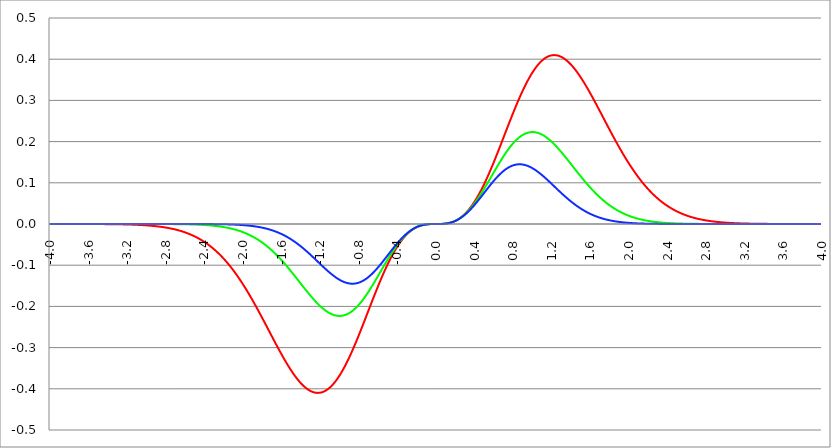
| Category | Series 1 | Series 0 | Series 2 |
|---|---|---|---|
| -4.0 | 0 | 0 | 0 |
| -3.996 | 0 | 0 | 0 |
| -3.992 | 0 | 0 | 0 |
| -3.988 | 0 | 0 | 0 |
| -3.984 | 0 | 0 | 0 |
| -3.98 | 0 | 0 | 0 |
| -3.976 | 0 | 0 | 0 |
| -3.972 | 0 | 0 | 0 |
| -3.968 | 0 | 0 | 0 |
| -3.964 | 0 | 0 | 0 |
| -3.96 | 0 | 0 | 0 |
| -3.956 | 0 | 0 | 0 |
| -3.952 | 0 | 0 | 0 |
| -3.948 | 0 | 0 | 0 |
| -3.944 | 0 | 0 | 0 |
| -3.94 | 0 | 0 | 0 |
| -3.936 | 0 | 0 | 0 |
| -3.932 | 0 | 0 | 0 |
| -3.928 | 0 | 0 | 0 |
| -3.924 | 0 | 0 | 0 |
| -3.92 | 0 | 0 | 0 |
| -3.916 | 0 | 0 | 0 |
| -3.912 | 0 | 0 | 0 |
| -3.908 | 0 | 0 | 0 |
| -3.904 | 0 | 0 | 0 |
| -3.9 | 0 | 0 | 0 |
| -3.896 | 0 | 0 | 0 |
| -3.892 | 0 | 0 | 0 |
| -3.888 | 0 | 0 | 0 |
| -3.884 | 0 | 0 | 0 |
| -3.88 | 0 | 0 | 0 |
| -3.876 | 0 | 0 | 0 |
| -3.872 | 0 | 0 | 0 |
| -3.868 | 0 | 0 | 0 |
| -3.864 | 0 | 0 | 0 |
| -3.86 | 0 | 0 | 0 |
| -3.856 | 0 | 0 | 0 |
| -3.852 | 0 | 0 | 0 |
| -3.848 | 0 | 0 | 0 |
| -3.844 | 0 | 0 | 0 |
| -3.84 | 0 | 0 | 0 |
| -3.836 | 0 | 0 | 0 |
| -3.832 | 0 | 0 | 0 |
| -3.828 | 0 | 0 | 0 |
| -3.824 | 0 | 0 | 0 |
| -3.82 | 0 | 0 | 0 |
| -3.816 | 0 | 0 | 0 |
| -3.812 | 0 | 0 | 0 |
| -3.808 | 0 | 0 | 0 |
| -3.804 | 0 | 0 | 0 |
| -3.8 | 0 | 0 | 0 |
| -3.796 | 0 | 0 | 0 |
| -3.792 | 0 | 0 | 0 |
| -3.788 | 0 | 0 | 0 |
| -3.784 | 0 | 0 | 0 |
| -3.78 | 0 | 0 | 0 |
| -3.776 | 0 | 0 | 0 |
| -3.772 | 0 | 0 | 0 |
| -3.768 | 0 | 0 | 0 |
| -3.764 | 0 | 0 | 0 |
| -3.76 | 0 | 0 | 0 |
| -3.756 | 0 | 0 | 0 |
| -3.752 | 0 | 0 | 0 |
| -3.748 | 0 | 0 | 0 |
| -3.744 | 0 | 0 | 0 |
| -3.74 | 0 | 0 | 0 |
| -3.736 | 0 | 0 | 0 |
| -3.732 | 0 | 0 | 0 |
| -3.728 | 0 | 0 | 0 |
| -3.724 | 0 | 0 | 0 |
| -3.72 | 0 | 0 | 0 |
| -3.716 | 0 | 0 | 0 |
| -3.712 | 0 | 0 | 0 |
| -3.708 | 0 | 0 | 0 |
| -3.704 | 0 | 0 | 0 |
| -3.7 | 0 | 0 | 0 |
| -3.696 | 0 | 0 | 0 |
| -3.692 | 0 | 0 | 0 |
| -3.688 | 0 | 0 | 0 |
| -3.684 | 0 | 0 | 0 |
| -3.68 | 0 | 0 | 0 |
| -3.676 | 0 | 0 | 0 |
| -3.672 | 0 | 0 | 0 |
| -3.668 | 0 | 0 | 0 |
| -3.664 | 0 | 0 | 0 |
| -3.66 | 0 | 0 | 0 |
| -3.656 | 0 | 0 | 0 |
| -3.652 | 0 | 0 | 0 |
| -3.648 | 0 | 0 | 0 |
| -3.644 | 0 | 0 | 0 |
| -3.64 | 0 | 0 | 0 |
| -3.636 | 0 | 0 | 0 |
| -3.632 | 0 | 0 | 0 |
| -3.628 | 0 | 0 | 0 |
| -3.624 | 0 | 0 | 0 |
| -3.62 | 0 | 0 | 0 |
| -3.616 | 0 | 0 | 0 |
| -3.612 | 0 | 0 | 0 |
| -3.608 | 0 | 0 | 0 |
| -3.604 | 0 | 0 | 0 |
| -3.6 | 0 | 0 | 0 |
| -3.596 | 0 | 0 | 0 |
| -3.592 | 0 | 0 | 0 |
| -3.588 | 0 | 0 | 0 |
| -3.584 | 0 | 0 | 0 |
| -3.58 | 0 | 0 | 0 |
| -3.576 | 0 | 0 | 0 |
| -3.572 | 0 | 0 | 0 |
| -3.568 | 0 | 0 | 0 |
| -3.564 | 0 | 0 | 0 |
| -3.56 | 0 | 0 | 0 |
| -3.556 | 0 | 0 | 0 |
| -3.552 | 0 | 0 | 0 |
| -3.548 | 0 | 0 | 0 |
| -3.544 | 0 | 0 | 0 |
| -3.54 | 0 | 0 | 0 |
| -3.536 | 0 | 0 | 0 |
| -3.532 | 0 | 0 | 0 |
| -3.528 | 0 | 0 | 0 |
| -3.524 | 0 | 0 | 0 |
| -3.52 | 0 | 0 | 0 |
| -3.516 | 0 | 0 | 0 |
| -3.512 | 0 | 0 | 0 |
| -3.508 | 0 | 0 | 0 |
| -3.504 | 0 | 0 | 0 |
| -3.5 | 0 | 0 | 0 |
| -3.496 | 0 | 0 | 0 |
| -3.492 | 0 | 0 | 0 |
| -3.488 | 0 | 0 | 0 |
| -3.484 | 0 | 0 | 0 |
| -3.48 | 0 | 0 | 0 |
| -3.476 | 0 | 0 | 0 |
| -3.472 | 0 | 0 | 0 |
| -3.467999999999999 | 0 | 0 | 0 |
| -3.463999999999999 | 0 | 0 | 0 |
| -3.459999999999999 | 0 | 0 | 0 |
| -3.455999999999999 | 0 | 0 | 0 |
| -3.451999999999999 | 0 | 0 | 0 |
| -3.447999999999999 | 0 | 0 | 0 |
| -3.443999999999999 | 0 | 0 | 0 |
| -3.439999999999999 | 0 | 0 | 0 |
| -3.435999999999999 | 0 | 0 | 0 |
| -3.431999999999999 | 0 | 0 | 0 |
| -3.427999999999999 | 0 | 0 | 0 |
| -3.423999999999999 | 0 | 0 | 0 |
| -3.419999999999999 | 0 | 0 | 0 |
| -3.415999999999999 | 0 | 0 | 0 |
| -3.411999999999999 | 0 | 0 | 0 |
| -3.407999999999999 | 0 | 0 | 0 |
| -3.403999999999999 | 0 | 0 | 0 |
| -3.399999999999999 | 0 | 0 | 0 |
| -3.395999999999999 | 0 | 0 | 0 |
| -3.391999999999999 | 0 | 0 | 0 |
| -3.387999999999999 | 0 | 0 | 0 |
| -3.383999999999999 | 0 | 0 | 0 |
| -3.379999999999999 | 0 | 0 | 0 |
| -3.375999999999999 | 0 | 0 | 0 |
| -3.371999999999999 | 0 | 0 | 0 |
| -3.367999999999999 | 0 | 0 | 0 |
| -3.363999999999999 | 0 | 0 | 0 |
| -3.359999999999999 | 0 | 0 | 0 |
| -3.355999999999999 | 0 | 0 | 0 |
| -3.351999999999999 | 0 | 0 | 0 |
| -3.347999999999999 | -0.001 | 0 | 0 |
| -3.343999999999999 | -0.001 | 0 | 0 |
| -3.339999999999999 | -0.001 | 0 | 0 |
| -3.335999999999999 | -0.001 | 0 | 0 |
| -3.331999999999999 | -0.001 | 0 | 0 |
| -3.327999999999999 | -0.001 | 0 | 0 |
| -3.323999999999999 | -0.001 | 0 | 0 |
| -3.319999999999999 | -0.001 | 0 | 0 |
| -3.315999999999999 | -0.001 | 0 | 0 |
| -3.311999999999999 | -0.001 | 0 | 0 |
| -3.307999999999999 | -0.001 | 0 | 0 |
| -3.303999999999999 | -0.001 | 0 | 0 |
| -3.299999999999999 | -0.001 | 0 | 0 |
| -3.295999999999999 | -0.001 | 0 | 0 |
| -3.291999999999999 | -0.001 | 0 | 0 |
| -3.288 | -0.001 | 0 | 0 |
| -3.284 | -0.001 | 0 | 0 |
| -3.279999999999999 | -0.001 | 0 | 0 |
| -3.275999999999999 | -0.001 | 0 | 0 |
| -3.271999999999999 | -0.001 | 0 | 0 |
| -3.268 | -0.001 | 0 | 0 |
| -3.264 | -0.001 | 0 | 0 |
| -3.259999999999999 | -0.001 | 0 | 0 |
| -3.255999999999999 | -0.001 | 0 | 0 |
| -3.251999999999999 | -0.001 | 0 | 0 |
| -3.248 | -0.001 | 0 | 0 |
| -3.244 | -0.001 | 0 | 0 |
| -3.239999999999999 | -0.001 | 0 | 0 |
| -3.235999999999999 | -0.001 | 0 | 0 |
| -3.231999999999999 | -0.001 | 0 | 0 |
| -3.228 | -0.001 | 0 | 0 |
| -3.224 | -0.001 | 0 | 0 |
| -3.219999999999999 | -0.001 | 0 | 0 |
| -3.215999999999999 | -0.001 | 0 | 0 |
| -3.211999999999999 | -0.001 | 0 | 0 |
| -3.208 | -0.001 | 0 | 0 |
| -3.204 | -0.001 | 0 | 0 |
| -3.199999999999999 | -0.001 | 0 | 0 |
| -3.195999999999999 | -0.001 | 0 | 0 |
| -3.191999999999999 | -0.001 | 0 | 0 |
| -3.188 | -0.001 | 0 | 0 |
| -3.184 | -0.001 | 0 | 0 |
| -3.179999999999999 | -0.001 | 0 | 0 |
| -3.175999999999999 | -0.001 | 0 | 0 |
| -3.171999999999999 | -0.001 | 0 | 0 |
| -3.168 | -0.001 | 0 | 0 |
| -3.164 | -0.001 | 0 | 0 |
| -3.159999999999999 | -0.001 | 0 | 0 |
| -3.155999999999999 | -0.001 | 0 | 0 |
| -3.151999999999999 | -0.002 | 0 | 0 |
| -3.148 | -0.002 | 0 | 0 |
| -3.144 | -0.002 | 0 | 0 |
| -3.139999999999999 | -0.002 | 0 | 0 |
| -3.135999999999999 | -0.002 | 0 | 0 |
| -3.131999999999999 | -0.002 | 0 | 0 |
| -3.128 | -0.002 | 0 | 0 |
| -3.124 | -0.002 | 0 | 0 |
| -3.119999999999999 | -0.002 | 0 | 0 |
| -3.115999999999999 | -0.002 | 0 | 0 |
| -3.111999999999999 | -0.002 | 0 | 0 |
| -3.108 | -0.002 | 0 | 0 |
| -3.104 | -0.002 | 0 | 0 |
| -3.099999999999999 | -0.002 | 0 | 0 |
| -3.095999999999999 | -0.002 | 0 | 0 |
| -3.091999999999999 | -0.002 | 0 | 0 |
| -3.088 | -0.002 | 0 | 0 |
| -3.084 | -0.002 | 0 | 0 |
| -3.079999999999999 | -0.002 | 0 | 0 |
| -3.075999999999999 | -0.002 | 0 | 0 |
| -3.071999999999999 | -0.002 | 0 | 0 |
| -3.068 | -0.002 | 0 | 0 |
| -3.064 | -0.002 | 0 | 0 |
| -3.059999999999999 | -0.002 | 0 | 0 |
| -3.055999999999999 | -0.003 | 0 | 0 |
| -3.051999999999999 | -0.003 | 0 | 0 |
| -3.048 | -0.003 | 0 | 0 |
| -3.044 | -0.003 | 0 | 0 |
| -3.039999999999999 | -0.003 | 0 | 0 |
| -3.035999999999999 | -0.003 | 0 | 0 |
| -3.031999999999999 | -0.003 | 0 | 0 |
| -3.028 | -0.003 | 0 | 0 |
| -3.024 | -0.003 | 0 | 0 |
| -3.019999999999999 | -0.003 | 0 | 0 |
| -3.015999999999999 | -0.003 | 0 | 0 |
| -3.011999999999999 | -0.003 | 0 | 0 |
| -3.008 | -0.003 | 0 | 0 |
| -3.004 | -0.003 | 0 | 0 |
| -2.999999999999999 | -0.003 | 0 | 0 |
| -2.995999999999999 | -0.003 | 0 | 0 |
| -2.991999999999999 | -0.003 | 0 | 0 |
| -2.988 | -0.004 | 0 | 0 |
| -2.984 | -0.004 | 0 | 0 |
| -2.979999999999999 | -0.004 | 0 | 0 |
| -2.975999999999999 | -0.004 | 0 | 0 |
| -2.971999999999999 | -0.004 | 0 | 0 |
| -2.968 | -0.004 | 0 | 0 |
| -2.964 | -0.004 | 0 | 0 |
| -2.959999999999999 | -0.004 | 0 | 0 |
| -2.955999999999999 | -0.004 | 0 | 0 |
| -2.951999999999999 | -0.004 | 0 | 0 |
| -2.948 | -0.004 | 0 | 0 |
| -2.944 | -0.004 | 0 | 0 |
| -2.939999999999999 | -0.004 | 0 | 0 |
| -2.935999999999999 | -0.005 | 0 | 0 |
| -2.931999999999999 | -0.005 | 0 | 0 |
| -2.928 | -0.005 | 0 | 0 |
| -2.924 | -0.005 | 0 | 0 |
| -2.919999999999999 | -0.005 | 0 | 0 |
| -2.915999999999999 | -0.005 | 0 | 0 |
| -2.911999999999999 | -0.005 | 0 | 0 |
| -2.908 | -0.005 | 0 | 0 |
| -2.904 | -0.005 | 0 | 0 |
| -2.899999999999999 | -0.005 | 0 | 0 |
| -2.895999999999999 | -0.006 | 0 | 0 |
| -2.891999999999999 | -0.006 | 0 | 0 |
| -2.887999999999999 | -0.006 | 0 | 0 |
| -2.883999999999999 | -0.006 | 0 | 0 |
| -2.879999999999999 | -0.006 | 0 | 0 |
| -2.875999999999999 | -0.006 | 0 | 0 |
| -2.871999999999999 | -0.006 | 0 | 0 |
| -2.867999999999999 | -0.006 | 0 | 0 |
| -2.863999999999999 | -0.006 | 0 | 0 |
| -2.859999999999999 | -0.007 | 0 | 0 |
| -2.855999999999999 | -0.007 | 0 | 0 |
| -2.851999999999999 | -0.007 | 0 | 0 |
| -2.847999999999999 | -0.007 | 0 | 0 |
| -2.843999999999999 | -0.007 | 0 | 0 |
| -2.839999999999999 | -0.007 | 0 | 0 |
| -2.835999999999999 | -0.007 | 0 | 0 |
| -2.831999999999999 | -0.007 | 0 | 0 |
| -2.827999999999999 | -0.008 | 0 | 0 |
| -2.823999999999999 | -0.008 | 0 | 0 |
| -2.819999999999999 | -0.008 | 0 | 0 |
| -2.815999999999999 | -0.008 | 0 | 0 |
| -2.811999999999999 | -0.008 | 0 | 0 |
| -2.807999999999999 | -0.008 | 0 | 0 |
| -2.803999999999999 | -0.008 | 0 | 0 |
| -2.799999999999999 | -0.009 | 0 | 0 |
| -2.795999999999999 | -0.009 | 0 | 0 |
| -2.791999999999999 | -0.009 | 0 | 0 |
| -2.787999999999999 | -0.009 | 0 | 0 |
| -2.783999999999999 | -0.009 | 0 | 0 |
| -2.779999999999999 | -0.009 | 0 | 0 |
| -2.775999999999999 | -0.01 | 0 | 0 |
| -2.771999999999999 | -0.01 | 0 | 0 |
| -2.767999999999999 | -0.01 | 0 | 0 |
| -2.763999999999999 | -0.01 | 0 | 0 |
| -2.759999999999999 | -0.01 | 0 | 0 |
| -2.755999999999999 | -0.011 | 0 | 0 |
| -2.751999999999999 | -0.011 | 0 | 0 |
| -2.747999999999999 | -0.011 | 0 | 0 |
| -2.743999999999999 | -0.011 | 0 | 0 |
| -2.739999999999999 | -0.011 | 0 | 0 |
| -2.735999999999999 | -0.011 | 0 | 0 |
| -2.731999999999999 | -0.012 | 0 | 0 |
| -2.727999999999999 | -0.012 | 0 | 0 |
| -2.723999999999999 | -0.012 | 0 | 0 |
| -2.719999999999999 | -0.012 | 0 | 0 |
| -2.715999999999999 | -0.013 | 0 | 0 |
| -2.711999999999999 | -0.013 | 0 | 0 |
| -2.707999999999999 | -0.013 | 0 | 0 |
| -2.703999999999999 | -0.013 | 0 | 0 |
| -2.699999999999999 | -0.013 | 0 | 0 |
| -2.695999999999999 | -0.014 | 0 | 0 |
| -2.691999999999999 | -0.014 | 0 | 0 |
| -2.687999999999999 | -0.014 | 0 | 0 |
| -2.683999999999999 | -0.014 | 0 | 0 |
| -2.679999999999999 | -0.015 | 0 | 0 |
| -2.675999999999999 | -0.015 | 0 | 0 |
| -2.671999999999999 | -0.015 | 0 | 0 |
| -2.667999999999999 | -0.015 | 0 | 0 |
| -2.663999999999999 | -0.016 | 0 | 0 |
| -2.659999999999999 | -0.016 | 0 | 0 |
| -2.655999999999999 | -0.016 | 0 | 0 |
| -2.651999999999999 | -0.016 | 0 | 0 |
| -2.647999999999999 | -0.017 | -0.001 | 0 |
| -2.643999999999999 | -0.017 | -0.001 | 0 |
| -2.639999999999999 | -0.017 | -0.001 | 0 |
| -2.635999999999999 | -0.018 | -0.001 | 0 |
| -2.631999999999999 | -0.018 | -0.001 | 0 |
| -2.627999999999999 | -0.018 | -0.001 | 0 |
| -2.623999999999999 | -0.018 | -0.001 | 0 |
| -2.619999999999999 | -0.019 | -0.001 | 0 |
| -2.615999999999999 | -0.019 | -0.001 | 0 |
| -2.611999999999999 | -0.019 | -0.001 | 0 |
| -2.607999999999999 | -0.02 | -0.001 | 0 |
| -2.603999999999999 | -0.02 | -0.001 | 0 |
| -2.599999999999999 | -0.02 | -0.001 | 0 |
| -2.595999999999999 | -0.021 | -0.001 | 0 |
| -2.591999999999999 | -0.021 | -0.001 | 0 |
| -2.587999999999999 | -0.021 | -0.001 | 0 |
| -2.583999999999999 | -0.022 | -0.001 | 0 |
| -2.579999999999999 | -0.022 | -0.001 | 0 |
| -2.575999999999999 | -0.022 | -0.001 | 0 |
| -2.571999999999999 | -0.023 | -0.001 | 0 |
| -2.567999999999999 | -0.023 | -0.001 | 0 |
| -2.563999999999999 | -0.024 | -0.001 | 0 |
| -2.559999999999999 | -0.024 | -0.001 | 0 |
| -2.555999999999999 | -0.024 | -0.001 | 0 |
| -2.551999999999999 | -0.025 | -0.001 | 0 |
| -2.547999999999999 | -0.025 | -0.001 | 0 |
| -2.543999999999999 | -0.025 | -0.001 | 0 |
| -2.539999999999999 | -0.026 | -0.001 | 0 |
| -2.535999999999999 | -0.026 | -0.001 | 0 |
| -2.531999999999999 | -0.027 | -0.001 | 0 |
| -2.527999999999999 | -0.027 | -0.001 | 0 |
| -2.523999999999999 | -0.028 | -0.001 | 0 |
| -2.519999999999999 | -0.028 | -0.001 | 0 |
| -2.515999999999999 | -0.028 | -0.001 | 0 |
| -2.511999999999999 | -0.029 | -0.001 | 0 |
| -2.507999999999999 | -0.029 | -0.001 | 0 |
| -2.503999999999999 | -0.03 | -0.001 | 0 |
| -2.499999999999999 | -0.03 | -0.001 | 0 |
| -2.495999999999999 | -0.031 | -0.001 | 0 |
| -2.491999999999999 | -0.031 | -0.001 | 0 |
| -2.487999999999999 | -0.032 | -0.001 | 0 |
| -2.483999999999999 | -0.032 | -0.001 | 0 |
| -2.479999999999999 | -0.033 | -0.002 | 0 |
| -2.475999999999999 | -0.033 | -0.002 | 0 |
| -2.471999999999999 | -0.034 | -0.002 | 0 |
| -2.467999999999999 | -0.034 | -0.002 | 0 |
| -2.463999999999999 | -0.035 | -0.002 | 0 |
| -2.459999999999999 | -0.035 | -0.002 | 0 |
| -2.455999999999999 | -0.036 | -0.002 | 0 |
| -2.451999999999999 | -0.036 | -0.002 | 0 |
| -2.447999999999999 | -0.037 | -0.002 | 0 |
| -2.443999999999999 | -0.037 | -0.002 | 0 |
| -2.439999999999999 | -0.038 | -0.002 | 0 |
| -2.435999999999999 | -0.038 | -0.002 | 0 |
| -2.431999999999999 | -0.039 | -0.002 | 0 |
| -2.427999999999999 | -0.039 | -0.002 | 0 |
| -2.423999999999999 | -0.04 | -0.002 | 0 |
| -2.419999999999999 | -0.041 | -0.002 | 0 |
| -2.415999999999999 | -0.041 | -0.002 | 0 |
| -2.411999999999999 | -0.042 | -0.002 | 0 |
| -2.407999999999999 | -0.042 | -0.002 | 0 |
| -2.403999999999999 | -0.043 | -0.002 | 0 |
| -2.399999999999999 | -0.044 | -0.002 | 0 |
| -2.395999999999999 | -0.044 | -0.003 | 0 |
| -2.391999999999999 | -0.045 | -0.003 | 0 |
| -2.387999999999999 | -0.045 | -0.003 | 0 |
| -2.383999999999999 | -0.046 | -0.003 | 0 |
| -2.379999999999999 | -0.047 | -0.003 | 0 |
| -2.375999999999999 | -0.047 | -0.003 | 0 |
| -2.371999999999999 | -0.048 | -0.003 | 0 |
| -2.367999999999998 | -0.049 | -0.003 | 0 |
| -2.363999999999998 | -0.049 | -0.003 | 0 |
| -2.359999999999998 | -0.05 | -0.003 | 0 |
| -2.355999999999998 | -0.051 | -0.003 | 0 |
| -2.351999999999998 | -0.052 | -0.003 | 0 |
| -2.347999999999998 | -0.052 | -0.003 | 0 |
| -2.343999999999998 | -0.053 | -0.003 | 0 |
| -2.339999999999998 | -0.054 | -0.003 | 0 |
| -2.335999999999998 | -0.054 | -0.004 | 0 |
| -2.331999999999998 | -0.055 | -0.004 | 0 |
| -2.327999999999998 | -0.056 | -0.004 | 0 |
| -2.323999999999998 | -0.057 | -0.004 | 0 |
| -2.319999999999998 | -0.057 | -0.004 | 0 |
| -2.315999999999998 | -0.058 | -0.004 | 0 |
| -2.311999999999998 | -0.059 | -0.004 | 0 |
| -2.307999999999998 | -0.06 | -0.004 | 0 |
| -2.303999999999998 | -0.061 | -0.004 | 0 |
| -2.299999999999998 | -0.061 | -0.004 | 0 |
| -2.295999999999998 | -0.062 | -0.004 | 0 |
| -2.291999999999998 | -0.063 | -0.005 | 0 |
| -2.287999999999998 | -0.064 | -0.005 | 0 |
| -2.283999999999998 | -0.065 | -0.005 | 0 |
| -2.279999999999998 | -0.065 | -0.005 | 0 |
| -2.275999999999998 | -0.066 | -0.005 | 0 |
| -2.271999999999998 | -0.067 | -0.005 | 0 |
| -2.267999999999998 | -0.068 | -0.005 | 0 |
| -2.263999999999998 | -0.069 | -0.005 | 0 |
| -2.259999999999998 | -0.07 | -0.005 | 0 |
| -2.255999999999998 | -0.071 | -0.006 | 0 |
| -2.251999999999998 | -0.072 | -0.006 | 0 |
| -2.247999999999998 | -0.073 | -0.006 | 0 |
| -2.243999999999998 | -0.073 | -0.006 | 0 |
| -2.239999999999998 | -0.074 | -0.006 | 0 |
| -2.235999999999998 | -0.075 | -0.006 | -0.001 |
| -2.231999999999998 | -0.076 | -0.006 | -0.001 |
| -2.227999999999998 | -0.077 | -0.006 | -0.001 |
| -2.223999999999998 | -0.078 | -0.007 | -0.001 |
| -2.219999999999998 | -0.079 | -0.007 | -0.001 |
| -2.215999999999998 | -0.08 | -0.007 | -0.001 |
| -2.211999999999998 | -0.081 | -0.007 | -0.001 |
| -2.207999999999998 | -0.082 | -0.007 | -0.001 |
| -2.203999999999998 | -0.083 | -0.007 | -0.001 |
| -2.199999999999998 | -0.084 | -0.007 | -0.001 |
| -2.195999999999998 | -0.085 | -0.008 | -0.001 |
| -2.191999999999998 | -0.086 | -0.008 | -0.001 |
| -2.187999999999998 | -0.087 | -0.008 | -0.001 |
| -2.183999999999998 | -0.088 | -0.008 | -0.001 |
| -2.179999999999998 | -0.089 | -0.008 | -0.001 |
| -2.175999999999998 | -0.09 | -0.008 | -0.001 |
| -2.171999999999998 | -0.092 | -0.009 | -0.001 |
| -2.167999999999998 | -0.093 | -0.009 | -0.001 |
| -2.163999999999998 | -0.094 | -0.009 | -0.001 |
| -2.159999999999998 | -0.095 | -0.009 | -0.001 |
| -2.155999999999998 | -0.096 | -0.009 | -0.001 |
| -2.151999999999998 | -0.097 | -0.01 | -0.001 |
| -2.147999999999998 | -0.098 | -0.01 | -0.001 |
| -2.143999999999998 | -0.099 | -0.01 | -0.001 |
| -2.139999999999998 | -0.101 | -0.01 | -0.001 |
| -2.135999999999998 | -0.102 | -0.01 | -0.001 |
| -2.131999999999998 | -0.103 | -0.011 | -0.001 |
| -2.127999999999998 | -0.104 | -0.011 | -0.001 |
| -2.123999999999998 | -0.105 | -0.011 | -0.001 |
| -2.119999999999998 | -0.106 | -0.011 | -0.001 |
| -2.115999999999998 | -0.108 | -0.011 | -0.001 |
| -2.111999999999998 | -0.109 | -0.012 | -0.001 |
| -2.107999999999998 | -0.11 | -0.012 | -0.001 |
| -2.103999999999998 | -0.111 | -0.012 | -0.001 |
| -2.099999999999998 | -0.113 | -0.012 | -0.001 |
| -2.095999999999998 | -0.114 | -0.013 | -0.001 |
| -2.091999999999998 | -0.115 | -0.013 | -0.001 |
| -2.087999999999998 | -0.116 | -0.013 | -0.001 |
| -2.083999999999998 | -0.118 | -0.013 | -0.002 |
| -2.079999999999998 | -0.119 | -0.014 | -0.002 |
| -2.075999999999998 | -0.12 | -0.014 | -0.002 |
| -2.071999999999998 | -0.122 | -0.014 | -0.002 |
| -2.067999999999998 | -0.123 | -0.014 | -0.002 |
| -2.063999999999998 | -0.124 | -0.015 | -0.002 |
| -2.059999999999998 | -0.125 | -0.015 | -0.002 |
| -2.055999999999998 | -0.127 | -0.015 | -0.002 |
| -2.051999999999998 | -0.128 | -0.016 | -0.002 |
| -2.047999999999998 | -0.13 | -0.016 | -0.002 |
| -2.043999999999998 | -0.131 | -0.016 | -0.002 |
| -2.039999999999998 | -0.132 | -0.017 | -0.002 |
| -2.035999999999998 | -0.134 | -0.017 | -0.002 |
| -2.031999999999998 | -0.135 | -0.017 | -0.002 |
| -2.027999999999998 | -0.136 | -0.017 | -0.002 |
| -2.023999999999998 | -0.138 | -0.018 | -0.002 |
| -2.019999999999998 | -0.139 | -0.018 | -0.002 |
| -2.015999999999998 | -0.141 | -0.018 | -0.002 |
| -2.011999999999998 | -0.142 | -0.019 | -0.002 |
| -2.007999999999998 | -0.144 | -0.019 | -0.003 |
| -2.003999999999998 | -0.145 | -0.019 | -0.003 |
| -1.999999999999998 | -0.147 | -0.02 | -0.003 |
| -1.995999999999998 | -0.148 | -0.02 | -0.003 |
| -1.991999999999998 | -0.149 | -0.021 | -0.003 |
| -1.987999999999998 | -0.151 | -0.021 | -0.003 |
| -1.983999999999998 | -0.152 | -0.021 | -0.003 |
| -1.979999999999998 | -0.154 | -0.022 | -0.003 |
| -1.975999999999998 | -0.155 | -0.022 | -0.003 |
| -1.971999999999998 | -0.157 | -0.022 | -0.003 |
| -1.967999999999998 | -0.159 | -0.023 | -0.003 |
| -1.963999999999998 | -0.16 | -0.023 | -0.003 |
| -1.959999999999998 | -0.162 | -0.024 | -0.003 |
| -1.955999999999998 | -0.163 | -0.024 | -0.004 |
| -1.951999999999998 | -0.165 | -0.025 | -0.004 |
| -1.947999999999998 | -0.166 | -0.025 | -0.004 |
| -1.943999999999998 | -0.168 | -0.025 | -0.004 |
| -1.939999999999998 | -0.169 | -0.026 | -0.004 |
| -1.935999999999998 | -0.171 | -0.026 | -0.004 |
| -1.931999999999998 | -0.173 | -0.027 | -0.004 |
| -1.927999999999998 | -0.174 | -0.027 | -0.004 |
| -1.923999999999998 | -0.176 | -0.028 | -0.004 |
| -1.919999999999998 | -0.177 | -0.028 | -0.004 |
| -1.915999999999998 | -0.179 | -0.029 | -0.005 |
| -1.911999999999998 | -0.181 | -0.029 | -0.005 |
| -1.907999999999998 | -0.182 | -0.03 | -0.005 |
| -1.903999999999998 | -0.184 | -0.03 | -0.005 |
| -1.899999999999998 | -0.186 | -0.031 | -0.005 |
| -1.895999999999998 | -0.187 | -0.031 | -0.005 |
| -1.891999999999998 | -0.189 | -0.032 | -0.005 |
| -1.887999999999998 | -0.191 | -0.032 | -0.005 |
| -1.883999999999998 | -0.192 | -0.033 | -0.006 |
| -1.879999999999998 | -0.194 | -0.033 | -0.006 |
| -1.875999999999998 | -0.196 | -0.034 | -0.006 |
| -1.871999999999998 | -0.197 | -0.034 | -0.006 |
| -1.867999999999998 | -0.199 | -0.035 | -0.006 |
| -1.863999999999998 | -0.201 | -0.035 | -0.006 |
| -1.859999999999998 | -0.202 | -0.036 | -0.006 |
| -1.855999999999998 | -0.204 | -0.036 | -0.007 |
| -1.851999999999998 | -0.206 | -0.037 | -0.007 |
| -1.847999999999998 | -0.207 | -0.038 | -0.007 |
| -1.843999999999998 | -0.209 | -0.038 | -0.007 |
| -1.839999999999998 | -0.211 | -0.039 | -0.007 |
| -1.835999999999998 | -0.213 | -0.039 | -0.007 |
| -1.831999999999998 | -0.214 | -0.04 | -0.007 |
| -1.827999999999998 | -0.216 | -0.041 | -0.008 |
| -1.823999999999998 | -0.218 | -0.041 | -0.008 |
| -1.819999999999998 | -0.22 | -0.042 | -0.008 |
| -1.815999999999998 | -0.221 | -0.043 | -0.008 |
| -1.811999999999998 | -0.223 | -0.043 | -0.008 |
| -1.807999999999998 | -0.225 | -0.044 | -0.009 |
| -1.803999999999998 | -0.227 | -0.045 | -0.009 |
| -1.799999999999998 | -0.228 | -0.045 | -0.009 |
| -1.795999999999998 | -0.23 | -0.046 | -0.009 |
| -1.791999999999998 | -0.232 | -0.047 | -0.009 |
| -1.787999999999998 | -0.234 | -0.047 | -0.01 |
| -1.783999999999998 | -0.235 | -0.048 | -0.01 |
| -1.779999999999998 | -0.237 | -0.049 | -0.01 |
| -1.775999999999998 | -0.239 | -0.049 | -0.01 |
| -1.771999999999998 | -0.241 | -0.05 | -0.01 |
| -1.767999999999998 | -0.243 | -0.051 | -0.011 |
| -1.763999999999998 | -0.244 | -0.052 | -0.011 |
| -1.759999999999998 | -0.246 | -0.052 | -0.011 |
| -1.755999999999998 | -0.248 | -0.053 | -0.011 |
| -1.751999999999998 | -0.25 | -0.054 | -0.012 |
| -1.747999999999998 | -0.252 | -0.055 | -0.012 |
| -1.743999999999998 | -0.253 | -0.055 | -0.012 |
| -1.739999999999998 | -0.255 | -0.056 | -0.012 |
| -1.735999999999998 | -0.257 | -0.057 | -0.013 |
| -1.731999999999998 | -0.259 | -0.058 | -0.013 |
| -1.727999999999998 | -0.261 | -0.059 | -0.013 |
| -1.723999999999998 | -0.262 | -0.059 | -0.013 |
| -1.719999999999998 | -0.264 | -0.06 | -0.014 |
| -1.715999999999998 | -0.266 | -0.061 | -0.014 |
| -1.711999999999998 | -0.268 | -0.062 | -0.014 |
| -1.707999999999998 | -0.269 | -0.063 | -0.015 |
| -1.703999999999998 | -0.271 | -0.064 | -0.015 |
| -1.699999999999998 | -0.273 | -0.064 | -0.015 |
| -1.695999999999998 | -0.275 | -0.065 | -0.015 |
| -1.691999999999998 | -0.277 | -0.066 | -0.016 |
| -1.687999999999998 | -0.278 | -0.067 | -0.016 |
| -1.683999999999998 | -0.28 | -0.068 | -0.016 |
| -1.679999999999998 | -0.282 | -0.069 | -0.017 |
| -1.675999999999998 | -0.284 | -0.07 | -0.017 |
| -1.671999999999998 | -0.285 | -0.071 | -0.017 |
| -1.667999999999998 | -0.287 | -0.071 | -0.018 |
| -1.663999999999998 | -0.289 | -0.072 | -0.018 |
| -1.659999999999998 | -0.291 | -0.073 | -0.018 |
| -1.655999999999998 | -0.293 | -0.074 | -0.019 |
| -1.651999999999998 | -0.294 | -0.075 | -0.019 |
| -1.647999999999998 | -0.296 | -0.076 | -0.02 |
| -1.643999999999998 | -0.298 | -0.077 | -0.02 |
| -1.639999999999998 | -0.3 | -0.078 | -0.02 |
| -1.635999999999998 | -0.301 | -0.079 | -0.021 |
| -1.631999999999998 | -0.303 | -0.08 | -0.021 |
| -1.627999999999998 | -0.305 | -0.081 | -0.022 |
| -1.623999999999998 | -0.306 | -0.082 | -0.022 |
| -1.619999999999998 | -0.308 | -0.083 | -0.022 |
| -1.615999999999998 | -0.31 | -0.084 | -0.023 |
| -1.611999999999998 | -0.312 | -0.085 | -0.023 |
| -1.607999999999998 | -0.313 | -0.086 | -0.024 |
| -1.603999999999998 | -0.315 | -0.087 | -0.024 |
| -1.599999999999998 | -0.317 | -0.088 | -0.024 |
| -1.595999999999998 | -0.318 | -0.089 | -0.025 |
| -1.591999999999998 | -0.32 | -0.09 | -0.025 |
| -1.587999999999998 | -0.322 | -0.091 | -0.026 |
| -1.583999999999998 | -0.323 | -0.092 | -0.026 |
| -1.579999999999998 | -0.325 | -0.093 | -0.027 |
| -1.575999999999998 | -0.327 | -0.094 | -0.027 |
| -1.571999999999998 | -0.328 | -0.095 | -0.028 |
| -1.567999999999998 | -0.33 | -0.096 | -0.028 |
| -1.563999999999998 | -0.331 | -0.098 | -0.029 |
| -1.559999999999998 | -0.333 | -0.099 | -0.029 |
| -1.555999999999998 | -0.335 | -0.1 | -0.03 |
| -1.551999999999998 | -0.336 | -0.101 | -0.03 |
| -1.547999999999998 | -0.338 | -0.102 | -0.031 |
| -1.543999999999998 | -0.339 | -0.103 | -0.031 |
| -1.539999999999998 | -0.341 | -0.104 | -0.032 |
| -1.535999999999998 | -0.342 | -0.105 | -0.032 |
| -1.531999999999998 | -0.344 | -0.106 | -0.033 |
| -1.527999999999998 | -0.345 | -0.107 | -0.033 |
| -1.523999999999998 | -0.347 | -0.109 | -0.034 |
| -1.519999999999998 | -0.348 | -0.11 | -0.035 |
| -1.515999999999998 | -0.35 | -0.111 | -0.035 |
| -1.511999999999998 | -0.351 | -0.112 | -0.036 |
| -1.507999999999998 | -0.353 | -0.113 | -0.036 |
| -1.503999999999998 | -0.354 | -0.114 | -0.037 |
| -1.499999999999998 | -0.356 | -0.115 | -0.037 |
| -1.495999999999998 | -0.357 | -0.117 | -0.038 |
| -1.491999999999998 | -0.359 | -0.118 | -0.039 |
| -1.487999999999998 | -0.36 | -0.119 | -0.039 |
| -1.483999999999998 | -0.361 | -0.12 | -0.04 |
| -1.479999999999998 | -0.363 | -0.121 | -0.041 |
| -1.475999999999998 | -0.364 | -0.122 | -0.041 |
| -1.471999999999998 | -0.365 | -0.124 | -0.042 |
| -1.467999999999998 | -0.367 | -0.125 | -0.042 |
| -1.463999999999998 | -0.368 | -0.126 | -0.043 |
| -1.459999999999998 | -0.369 | -0.127 | -0.044 |
| -1.455999999999998 | -0.371 | -0.128 | -0.044 |
| -1.451999999999998 | -0.372 | -0.13 | -0.045 |
| -1.447999999999998 | -0.373 | -0.131 | -0.046 |
| -1.443999999999998 | -0.374 | -0.132 | -0.047 |
| -1.439999999999998 | -0.375 | -0.133 | -0.047 |
| -1.435999999999998 | -0.377 | -0.134 | -0.048 |
| -1.431999999999998 | -0.378 | -0.136 | -0.049 |
| -1.427999999999998 | -0.379 | -0.137 | -0.049 |
| -1.423999999999998 | -0.38 | -0.138 | -0.05 |
| -1.419999999999998 | -0.381 | -0.139 | -0.051 |
| -1.415999999999998 | -0.382 | -0.14 | -0.051 |
| -1.411999999999998 | -0.383 | -0.141 | -0.052 |
| -1.407999999999998 | -0.384 | -0.143 | -0.053 |
| -1.403999999999998 | -0.385 | -0.144 | -0.054 |
| -1.399999999999998 | -0.387 | -0.145 | -0.054 |
| -1.395999999999998 | -0.388 | -0.146 | -0.055 |
| -1.391999999999998 | -0.389 | -0.147 | -0.056 |
| -1.387999999999998 | -0.389 | -0.149 | -0.057 |
| -1.383999999999998 | -0.39 | -0.15 | -0.057 |
| -1.379999999999998 | -0.391 | -0.151 | -0.058 |
| -1.375999999999998 | -0.392 | -0.152 | -0.059 |
| -1.371999999999998 | -0.393 | -0.153 | -0.06 |
| -1.367999999999998 | -0.394 | -0.155 | -0.061 |
| -1.363999999999998 | -0.395 | -0.156 | -0.061 |
| -1.359999999999998 | -0.396 | -0.157 | -0.062 |
| -1.355999999999998 | -0.396 | -0.158 | -0.063 |
| -1.351999999999998 | -0.397 | -0.159 | -0.064 |
| -1.347999999999998 | -0.398 | -0.16 | -0.065 |
| -1.343999999999998 | -0.399 | -0.162 | -0.065 |
| -1.339999999999998 | -0.399 | -0.163 | -0.066 |
| -1.335999999999998 | -0.4 | -0.164 | -0.067 |
| -1.331999999999998 | -0.401 | -0.165 | -0.068 |
| -1.327999999999998 | -0.401 | -0.166 | -0.069 |
| -1.323999999999998 | -0.402 | -0.167 | -0.07 |
| -1.319999999999998 | -0.403 | -0.169 | -0.071 |
| -1.315999999999998 | -0.403 | -0.17 | -0.071 |
| -1.311999999999998 | -0.404 | -0.171 | -0.072 |
| -1.307999999999998 | -0.404 | -0.172 | -0.073 |
| -1.303999999999998 | -0.405 | -0.173 | -0.074 |
| -1.299999999999998 | -0.405 | -0.174 | -0.075 |
| -1.295999999999998 | -0.406 | -0.175 | -0.076 |
| -1.291999999999998 | -0.406 | -0.176 | -0.077 |
| -1.287999999999998 | -0.407 | -0.177 | -0.077 |
| -1.283999999999998 | -0.407 | -0.179 | -0.078 |
| -1.279999999999998 | -0.407 | -0.18 | -0.079 |
| -1.275999999999998 | -0.408 | -0.181 | -0.08 |
| -1.271999999999998 | -0.408 | -0.182 | -0.081 |
| -1.267999999999998 | -0.408 | -0.183 | -0.082 |
| -1.263999999999998 | -0.409 | -0.184 | -0.083 |
| -1.259999999999998 | -0.409 | -0.185 | -0.084 |
| -1.255999999999998 | -0.409 | -0.186 | -0.084 |
| -1.251999999999998 | -0.409 | -0.187 | -0.085 |
| -1.247999999999998 | -0.409 | -0.188 | -0.086 |
| -1.243999999999998 | -0.41 | -0.189 | -0.087 |
| -1.239999999999998 | -0.41 | -0.19 | -0.088 |
| -1.235999999999998 | -0.41 | -0.191 | -0.089 |
| -1.231999999999998 | -0.41 | -0.192 | -0.09 |
| -1.227999999999998 | -0.41 | -0.193 | -0.091 |
| -1.223999999999998 | -0.41 | -0.194 | -0.092 |
| -1.219999999999998 | -0.41 | -0.195 | -0.093 |
| -1.215999999999998 | -0.41 | -0.196 | -0.093 |
| -1.211999999999998 | -0.41 | -0.197 | -0.094 |
| -1.207999999999998 | -0.41 | -0.198 | -0.095 |
| -1.203999999999998 | -0.41 | -0.198 | -0.096 |
| -1.199999999999997 | -0.409 | -0.199 | -0.097 |
| -1.195999999999997 | -0.409 | -0.2 | -0.098 |
| -1.191999999999997 | -0.409 | -0.201 | -0.099 |
| -1.187999999999997 | -0.409 | -0.202 | -0.1 |
| -1.183999999999997 | -0.409 | -0.203 | -0.101 |
| -1.179999999999997 | -0.408 | -0.204 | -0.101 |
| -1.175999999999997 | -0.408 | -0.204 | -0.102 |
| -1.171999999999997 | -0.408 | -0.205 | -0.103 |
| -1.167999999999997 | -0.407 | -0.206 | -0.104 |
| -1.163999999999997 | -0.407 | -0.207 | -0.105 |
| -1.159999999999997 | -0.406 | -0.207 | -0.106 |
| -1.155999999999997 | -0.406 | -0.208 | -0.107 |
| -1.151999999999997 | -0.406 | -0.209 | -0.108 |
| -1.147999999999997 | -0.405 | -0.21 | -0.108 |
| -1.143999999999997 | -0.404 | -0.21 | -0.109 |
| -1.139999999999997 | -0.404 | -0.211 | -0.11 |
| -1.135999999999997 | -0.403 | -0.212 | -0.111 |
| -1.131999999999997 | -0.403 | -0.212 | -0.112 |
| -1.127999999999997 | -0.402 | -0.213 | -0.113 |
| -1.123999999999997 | -0.401 | -0.213 | -0.113 |
| -1.119999999999997 | -0.401 | -0.214 | -0.114 |
| -1.115999999999997 | -0.4 | -0.215 | -0.115 |
| -1.111999999999997 | -0.399 | -0.215 | -0.116 |
| -1.107999999999997 | -0.399 | -0.216 | -0.117 |
| -1.103999999999997 | -0.398 | -0.216 | -0.118 |
| -1.099999999999997 | -0.397 | -0.217 | -0.118 |
| -1.095999999999997 | -0.396 | -0.217 | -0.119 |
| -1.091999999999997 | -0.395 | -0.218 | -0.12 |
| -1.087999999999997 | -0.394 | -0.218 | -0.121 |
| -1.083999999999997 | -0.393 | -0.219 | -0.121 |
| -1.079999999999997 | -0.392 | -0.219 | -0.122 |
| -1.075999999999997 | -0.391 | -0.219 | -0.123 |
| -1.071999999999997 | -0.39 | -0.22 | -0.124 |
| -1.067999999999997 | -0.389 | -0.22 | -0.124 |
| -1.063999999999997 | -0.388 | -0.22 | -0.125 |
| -1.059999999999997 | -0.387 | -0.221 | -0.126 |
| -1.055999999999997 | -0.386 | -0.221 | -0.127 |
| -1.051999999999997 | -0.385 | -0.221 | -0.127 |
| -1.047999999999997 | -0.384 | -0.222 | -0.128 |
| -1.043999999999997 | -0.383 | -0.222 | -0.129 |
| -1.039999999999997 | -0.381 | -0.222 | -0.129 |
| -1.035999999999997 | -0.38 | -0.222 | -0.13 |
| -1.031999999999997 | -0.379 | -0.222 | -0.131 |
| -1.027999999999997 | -0.378 | -0.223 | -0.131 |
| -1.023999999999997 | -0.376 | -0.223 | -0.132 |
| -1.019999999999997 | -0.375 | -0.223 | -0.132 |
| -1.015999999999997 | -0.374 | -0.223 | -0.133 |
| -1.011999999999997 | -0.372 | -0.223 | -0.134 |
| -1.007999999999997 | -0.371 | -0.223 | -0.134 |
| -1.003999999999997 | -0.369 | -0.223 | -0.135 |
| -0.999999999999997 | -0.368 | -0.223 | -0.135 |
| -0.995999999999997 | -0.366 | -0.223 | -0.136 |
| -0.991999999999997 | -0.365 | -0.223 | -0.136 |
| -0.987999999999997 | -0.363 | -0.223 | -0.137 |
| -0.983999999999997 | -0.362 | -0.223 | -0.137 |
| -0.979999999999997 | -0.36 | -0.223 | -0.138 |
| -0.975999999999997 | -0.359 | -0.223 | -0.138 |
| -0.971999999999997 | -0.357 | -0.223 | -0.139 |
| -0.967999999999997 | -0.355 | -0.222 | -0.139 |
| -0.963999999999997 | -0.354 | -0.222 | -0.14 |
| -0.959999999999997 | -0.352 | -0.222 | -0.14 |
| -0.955999999999997 | -0.35 | -0.222 | -0.14 |
| -0.951999999999997 | -0.349 | -0.222 | -0.141 |
| -0.947999999999997 | -0.347 | -0.221 | -0.141 |
| -0.943999999999997 | -0.345 | -0.221 | -0.142 |
| -0.939999999999997 | -0.343 | -0.221 | -0.142 |
| -0.935999999999997 | -0.341 | -0.22 | -0.142 |
| -0.931999999999997 | -0.34 | -0.22 | -0.142 |
| -0.927999999999997 | -0.338 | -0.22 | -0.143 |
| -0.923999999999997 | -0.336 | -0.219 | -0.143 |
| -0.919999999999997 | -0.334 | -0.219 | -0.143 |
| -0.915999999999997 | -0.332 | -0.218 | -0.144 |
| -0.911999999999997 | -0.33 | -0.218 | -0.144 |
| -0.907999999999997 | -0.328 | -0.217 | -0.144 |
| -0.903999999999997 | -0.326 | -0.217 | -0.144 |
| -0.899999999999997 | -0.324 | -0.216 | -0.144 |
| -0.895999999999997 | -0.322 | -0.216 | -0.144 |
| -0.891999999999997 | -0.32 | -0.215 | -0.145 |
| -0.887999999999997 | -0.318 | -0.215 | -0.145 |
| -0.883999999999997 | -0.316 | -0.214 | -0.145 |
| -0.879999999999997 | -0.314 | -0.213 | -0.145 |
| -0.875999999999997 | -0.312 | -0.213 | -0.145 |
| -0.871999999999997 | -0.31 | -0.212 | -0.145 |
| -0.867999999999997 | -0.308 | -0.211 | -0.145 |
| -0.863999999999997 | -0.306 | -0.21 | -0.145 |
| -0.859999999999997 | -0.304 | -0.21 | -0.145 |
| -0.855999999999997 | -0.301 | -0.209 | -0.145 |
| -0.851999999999997 | -0.299 | -0.208 | -0.145 |
| -0.847999999999997 | -0.297 | -0.207 | -0.145 |
| -0.843999999999997 | -0.295 | -0.207 | -0.145 |
| -0.839999999999997 | -0.293 | -0.206 | -0.145 |
| -0.835999999999997 | -0.29 | -0.205 | -0.144 |
| -0.831999999999997 | -0.288 | -0.204 | -0.144 |
| -0.827999999999997 | -0.286 | -0.203 | -0.144 |
| -0.823999999999997 | -0.284 | -0.202 | -0.144 |
| -0.819999999999997 | -0.281 | -0.201 | -0.144 |
| -0.815999999999997 | -0.279 | -0.2 | -0.143 |
| -0.811999999999997 | -0.277 | -0.199 | -0.143 |
| -0.807999999999997 | -0.275 | -0.198 | -0.143 |
| -0.803999999999997 | -0.272 | -0.197 | -0.143 |
| -0.799999999999997 | -0.27 | -0.196 | -0.142 |
| -0.795999999999997 | -0.268 | -0.195 | -0.142 |
| -0.791999999999997 | -0.265 | -0.194 | -0.142 |
| -0.787999999999997 | -0.263 | -0.193 | -0.141 |
| -0.783999999999997 | -0.261 | -0.192 | -0.141 |
| -0.779999999999997 | -0.258 | -0.191 | -0.141 |
| -0.775999999999997 | -0.256 | -0.189 | -0.14 |
| -0.771999999999997 | -0.254 | -0.188 | -0.14 |
| -0.767999999999997 | -0.251 | -0.187 | -0.139 |
| -0.763999999999997 | -0.249 | -0.186 | -0.139 |
| -0.759999999999997 | -0.246 | -0.185 | -0.138 |
| -0.755999999999997 | -0.244 | -0.183 | -0.138 |
| -0.751999999999997 | -0.242 | -0.182 | -0.137 |
| -0.747999999999997 | -0.239 | -0.181 | -0.137 |
| -0.743999999999997 | -0.237 | -0.18 | -0.136 |
| -0.739999999999997 | -0.234 | -0.178 | -0.136 |
| -0.735999999999997 | -0.232 | -0.177 | -0.135 |
| -0.731999999999997 | -0.23 | -0.176 | -0.134 |
| -0.727999999999997 | -0.227 | -0.174 | -0.134 |
| -0.723999999999997 | -0.225 | -0.173 | -0.133 |
| -0.719999999999997 | -0.222 | -0.172 | -0.132 |
| -0.715999999999997 | -0.22 | -0.17 | -0.132 |
| -0.711999999999997 | -0.217 | -0.169 | -0.131 |
| -0.707999999999997 | -0.215 | -0.167 | -0.13 |
| -0.703999999999997 | -0.213 | -0.166 | -0.129 |
| -0.699999999999997 | -0.21 | -0.164 | -0.129 |
| -0.695999999999997 | -0.208 | -0.163 | -0.128 |
| -0.691999999999997 | -0.205 | -0.162 | -0.127 |
| -0.687999999999997 | -0.203 | -0.16 | -0.126 |
| -0.683999999999997 | -0.2 | -0.159 | -0.126 |
| -0.679999999999997 | -0.198 | -0.157 | -0.125 |
| -0.675999999999997 | -0.196 | -0.156 | -0.124 |
| -0.671999999999997 | -0.193 | -0.154 | -0.123 |
| -0.667999999999997 | -0.191 | -0.153 | -0.122 |
| -0.663999999999997 | -0.188 | -0.151 | -0.121 |
| -0.659999999999997 | -0.186 | -0.15 | -0.12 |
| -0.655999999999997 | -0.184 | -0.148 | -0.119 |
| -0.651999999999997 | -0.181 | -0.146 | -0.118 |
| -0.647999999999997 | -0.179 | -0.145 | -0.117 |
| -0.643999999999997 | -0.176 | -0.143 | -0.117 |
| -0.639999999999997 | -0.174 | -0.142 | -0.116 |
| -0.635999999999997 | -0.172 | -0.14 | -0.115 |
| -0.631999999999997 | -0.169 | -0.139 | -0.114 |
| -0.627999999999997 | -0.167 | -0.137 | -0.113 |
| -0.623999999999997 | -0.165 | -0.135 | -0.112 |
| -0.619999999999997 | -0.162 | -0.134 | -0.11 |
| -0.615999999999997 | -0.16 | -0.132 | -0.109 |
| -0.611999999999997 | -0.158 | -0.131 | -0.108 |
| -0.607999999999997 | -0.155 | -0.129 | -0.107 |
| -0.603999999999997 | -0.153 | -0.127 | -0.106 |
| -0.599999999999997 | -0.151 | -0.126 | -0.105 |
| -0.595999999999997 | -0.148 | -0.124 | -0.104 |
| -0.591999999999997 | -0.146 | -0.123 | -0.103 |
| -0.587999999999997 | -0.144 | -0.121 | -0.102 |
| -0.583999999999997 | -0.142 | -0.119 | -0.101 |
| -0.579999999999997 | -0.139 | -0.118 | -0.1 |
| -0.575999999999997 | -0.137 | -0.116 | -0.098 |
| -0.571999999999997 | -0.135 | -0.115 | -0.097 |
| -0.567999999999997 | -0.133 | -0.113 | -0.096 |
| -0.563999999999997 | -0.131 | -0.111 | -0.095 |
| -0.559999999999997 | -0.128 | -0.11 | -0.094 |
| -0.555999999999997 | -0.126 | -0.108 | -0.093 |
| -0.551999999999997 | -0.124 | -0.106 | -0.091 |
| -0.547999999999997 | -0.122 | -0.105 | -0.09 |
| -0.543999999999997 | -0.12 | -0.103 | -0.089 |
| -0.539999999999997 | -0.118 | -0.102 | -0.088 |
| -0.535999999999997 | -0.116 | -0.1 | -0.087 |
| -0.531999999999997 | -0.113 | -0.098 | -0.085 |
| -0.527999999999997 | -0.111 | -0.097 | -0.084 |
| -0.523999999999997 | -0.109 | -0.095 | -0.083 |
| -0.519999999999997 | -0.107 | -0.094 | -0.082 |
| -0.515999999999997 | -0.105 | -0.092 | -0.081 |
| -0.511999999999997 | -0.103 | -0.091 | -0.079 |
| -0.507999999999997 | -0.101 | -0.089 | -0.078 |
| -0.503999999999997 | -0.099 | -0.087 | -0.077 |
| -0.499999999999997 | -0.097 | -0.086 | -0.076 |
| -0.495999999999997 | -0.095 | -0.084 | -0.075 |
| -0.491999999999997 | -0.093 | -0.083 | -0.073 |
| -0.487999999999997 | -0.092 | -0.081 | -0.072 |
| -0.483999999999997 | -0.09 | -0.08 | -0.071 |
| -0.479999999999997 | -0.088 | -0.078 | -0.07 |
| -0.475999999999997 | -0.086 | -0.077 | -0.069 |
| -0.471999999999997 | -0.084 | -0.075 | -0.067 |
| -0.467999999999997 | -0.082 | -0.074 | -0.066 |
| -0.463999999999997 | -0.081 | -0.072 | -0.065 |
| -0.459999999999997 | -0.079 | -0.071 | -0.064 |
| -0.455999999999997 | -0.077 | -0.069 | -0.063 |
| -0.451999999999997 | -0.075 | -0.068 | -0.061 |
| -0.447999999999997 | -0.074 | -0.067 | -0.06 |
| -0.443999999999997 | -0.072 | -0.065 | -0.059 |
| -0.439999999999997 | -0.07 | -0.064 | -0.058 |
| -0.435999999999997 | -0.069 | -0.062 | -0.057 |
| -0.431999999999997 | -0.067 | -0.061 | -0.056 |
| -0.427999999999997 | -0.065 | -0.06 | -0.054 |
| -0.423999999999997 | -0.064 | -0.058 | -0.053 |
| -0.419999999999997 | -0.062 | -0.057 | -0.052 |
| -0.415999999999997 | -0.061 | -0.056 | -0.051 |
| -0.411999999999997 | -0.059 | -0.054 | -0.05 |
| -0.407999999999997 | -0.058 | -0.053 | -0.049 |
| -0.403999999999997 | -0.056 | -0.052 | -0.048 |
| -0.399999999999997 | -0.055 | -0.05 | -0.046 |
| -0.395999999999997 | -0.053 | -0.049 | -0.045 |
| -0.391999999999997 | -0.052 | -0.048 | -0.044 |
| -0.387999999999997 | -0.05 | -0.047 | -0.043 |
| -0.383999999999997 | -0.049 | -0.045 | -0.042 |
| -0.379999999999997 | -0.047 | -0.044 | -0.041 |
| -0.375999999999997 | -0.046 | -0.043 | -0.04 |
| -0.371999999999997 | -0.045 | -0.042 | -0.039 |
| -0.367999999999997 | -0.044 | -0.041 | -0.038 |
| -0.363999999999997 | -0.042 | -0.04 | -0.037 |
| -0.359999999999997 | -0.041 | -0.038 | -0.036 |
| -0.355999999999997 | -0.04 | -0.037 | -0.035 |
| -0.351999999999997 | -0.039 | -0.036 | -0.034 |
| -0.347999999999997 | -0.037 | -0.035 | -0.033 |
| -0.343999999999997 | -0.036 | -0.034 | -0.032 |
| -0.339999999999997 | -0.035 | -0.033 | -0.031 |
| -0.335999999999997 | -0.034 | -0.032 | -0.03 |
| -0.331999999999997 | -0.033 | -0.031 | -0.029 |
| -0.327999999999997 | -0.032 | -0.03 | -0.028 |
| -0.323999999999997 | -0.031 | -0.029 | -0.028 |
| -0.319999999999997 | -0.03 | -0.028 | -0.027 |
| -0.315999999999997 | -0.029 | -0.027 | -0.026 |
| -0.311999999999997 | -0.028 | -0.026 | -0.025 |
| -0.307999999999997 | -0.027 | -0.025 | -0.024 |
| -0.303999999999997 | -0.026 | -0.024 | -0.023 |
| -0.299999999999997 | -0.025 | -0.024 | -0.023 |
| -0.295999999999997 | -0.024 | -0.023 | -0.022 |
| -0.291999999999997 | -0.023 | -0.022 | -0.021 |
| -0.287999999999997 | -0.022 | -0.021 | -0.02 |
| -0.283999999999997 | -0.021 | -0.02 | -0.019 |
| -0.279999999999997 | -0.02 | -0.02 | -0.019 |
| -0.275999999999997 | -0.019 | -0.019 | -0.018 |
| -0.271999999999997 | -0.019 | -0.018 | -0.017 |
| -0.267999999999997 | -0.018 | -0.017 | -0.017 |
| -0.263999999999997 | -0.017 | -0.017 | -0.016 |
| -0.259999999999997 | -0.016 | -0.016 | -0.015 |
| -0.255999999999997 | -0.016 | -0.015 | -0.015 |
| -0.251999999999997 | -0.015 | -0.015 | -0.014 |
| -0.247999999999997 | -0.014 | -0.014 | -0.013 |
| -0.243999999999997 | -0.014 | -0.013 | -0.013 |
| -0.239999999999997 | -0.013 | -0.013 | -0.012 |
| -0.235999999999997 | -0.012 | -0.012 | -0.012 |
| -0.231999999999997 | -0.012 | -0.012 | -0.011 |
| -0.227999999999997 | -0.011 | -0.011 | -0.011 |
| -0.223999999999997 | -0.011 | -0.01 | -0.01 |
| -0.219999999999997 | -0.01 | -0.01 | -0.01 |
| -0.215999999999997 | -0.01 | -0.009 | -0.009 |
| -0.211999999999997 | -0.009 | -0.009 | -0.009 |
| -0.207999999999997 | -0.009 | -0.008 | -0.008 |
| -0.203999999999997 | -0.008 | -0.008 | -0.008 |
| -0.199999999999997 | -0.008 | -0.008 | -0.007 |
| -0.195999999999997 | -0.007 | -0.007 | -0.007 |
| -0.191999999999997 | -0.007 | -0.007 | -0.007 |
| -0.187999999999997 | -0.006 | -0.006 | -0.006 |
| -0.183999999999997 | -0.006 | -0.006 | -0.006 |
| -0.179999999999997 | -0.006 | -0.006 | -0.005 |
| -0.175999999999997 | -0.005 | -0.005 | -0.005 |
| -0.171999999999997 | -0.005 | -0.005 | -0.005 |
| -0.167999999999997 | -0.005 | -0.005 | -0.004 |
| -0.163999999999997 | -0.004 | -0.004 | -0.004 |
| -0.159999999999997 | -0.004 | -0.004 | -0.004 |
| -0.155999999999997 | -0.004 | -0.004 | -0.004 |
| -0.151999999999997 | -0.003 | -0.003 | -0.003 |
| -0.147999999999997 | -0.003 | -0.003 | -0.003 |
| -0.143999999999997 | -0.003 | -0.003 | -0.003 |
| -0.139999999999997 | -0.003 | -0.003 | -0.003 |
| -0.135999999999997 | -0.002 | -0.002 | -0.002 |
| -0.131999999999997 | -0.002 | -0.002 | -0.002 |
| -0.127999999999997 | -0.002 | -0.002 | -0.002 |
| -0.123999999999997 | -0.002 | -0.002 | -0.002 |
| -0.119999999999997 | -0.002 | -0.002 | -0.002 |
| -0.115999999999997 | -0.002 | -0.002 | -0.002 |
| -0.111999999999997 | -0.001 | -0.001 | -0.001 |
| -0.107999999999997 | -0.001 | -0.001 | -0.001 |
| -0.103999999999997 | -0.001 | -0.001 | -0.001 |
| -0.0999999999999965 | -0.001 | -0.001 | -0.001 |
| -0.0959999999999965 | -0.001 | -0.001 | -0.001 |
| -0.0919999999999965 | -0.001 | -0.001 | -0.001 |
| -0.0879999999999965 | -0.001 | -0.001 | -0.001 |
| -0.0839999999999965 | -0.001 | -0.001 | -0.001 |
| -0.0799999999999965 | -0.001 | -0.001 | -0.001 |
| -0.0759999999999965 | 0 | 0 | 0 |
| -0.0719999999999965 | 0 | 0 | 0 |
| -0.0679999999999965 | 0 | 0 | 0 |
| -0.0639999999999965 | 0 | 0 | 0 |
| -0.0599999999999965 | 0 | 0 | 0 |
| -0.0559999999999965 | 0 | 0 | 0 |
| -0.0519999999999965 | 0 | 0 | 0 |
| -0.0479999999999965 | 0 | 0 | 0 |
| -0.0439999999999965 | 0 | 0 | 0 |
| -0.0399999999999965 | 0 | 0 | 0 |
| -0.0359999999999965 | 0 | 0 | 0 |
| -0.0319999999999965 | 0 | 0 | 0 |
| -0.0279999999999965 | 0 | 0 | 0 |
| -0.0239999999999965 | 0 | 0 | 0 |
| -0.0199999999999965 | 0 | 0 | 0 |
| -0.0159999999999965 | 0 | 0 | 0 |
| -0.0119999999999965 | 0 | 0 | 0 |
| -0.00799999999999647 | 0 | 0 | 0 |
| -0.00399999999999647 | 0 | 0 | 0 |
| 3.52495810318487e-15 | 0 | 0 | 0 |
| 0.00400000000000352 | 0 | 0 | 0 |
| 0.00800000000000352 | 0 | 0 | 0 |
| 0.0120000000000035 | 0 | 0 | 0 |
| 0.0160000000000035 | 0 | 0 | 0 |
| 0.0200000000000035 | 0 | 0 | 0 |
| 0.0240000000000035 | 0 | 0 | 0 |
| 0.0280000000000035 | 0 | 0 | 0 |
| 0.0320000000000035 | 0 | 0 | 0 |
| 0.0360000000000035 | 0 | 0 | 0 |
| 0.0400000000000035 | 0 | 0 | 0 |
| 0.0440000000000035 | 0 | 0 | 0 |
| 0.0480000000000035 | 0 | 0 | 0 |
| 0.0520000000000035 | 0 | 0 | 0 |
| 0.0560000000000035 | 0 | 0 | 0 |
| 0.0600000000000035 | 0 | 0 | 0 |
| 0.0640000000000035 | 0 | 0 | 0 |
| 0.0680000000000035 | 0 | 0 | 0 |
| 0.0720000000000036 | 0 | 0 | 0 |
| 0.0760000000000036 | 0 | 0 | 0 |
| 0.0800000000000036 | 0.001 | 0.001 | 0.001 |
| 0.0840000000000036 | 0.001 | 0.001 | 0.001 |
| 0.0880000000000036 | 0.001 | 0.001 | 0.001 |
| 0.0920000000000036 | 0.001 | 0.001 | 0.001 |
| 0.0960000000000036 | 0.001 | 0.001 | 0.001 |
| 0.100000000000004 | 0.001 | 0.001 | 0.001 |
| 0.104000000000004 | 0.001 | 0.001 | 0.001 |
| 0.108000000000004 | 0.001 | 0.001 | 0.001 |
| 0.112000000000004 | 0.001 | 0.001 | 0.001 |
| 0.116000000000004 | 0.002 | 0.002 | 0.002 |
| 0.120000000000004 | 0.002 | 0.002 | 0.002 |
| 0.124000000000004 | 0.002 | 0.002 | 0.002 |
| 0.128000000000004 | 0.002 | 0.002 | 0.002 |
| 0.132000000000004 | 0.002 | 0.002 | 0.002 |
| 0.136000000000004 | 0.002 | 0.002 | 0.002 |
| 0.140000000000004 | 0.003 | 0.003 | 0.003 |
| 0.144000000000004 | 0.003 | 0.003 | 0.003 |
| 0.148000000000004 | 0.003 | 0.003 | 0.003 |
| 0.152000000000004 | 0.003 | 0.003 | 0.003 |
| 0.156000000000004 | 0.004 | 0.004 | 0.004 |
| 0.160000000000004 | 0.004 | 0.004 | 0.004 |
| 0.164000000000004 | 0.004 | 0.004 | 0.004 |
| 0.168000000000004 | 0.005 | 0.005 | 0.004 |
| 0.172000000000004 | 0.005 | 0.005 | 0.005 |
| 0.176000000000004 | 0.005 | 0.005 | 0.005 |
| 0.180000000000004 | 0.006 | 0.006 | 0.005 |
| 0.184000000000004 | 0.006 | 0.006 | 0.006 |
| 0.188000000000004 | 0.006 | 0.006 | 0.006 |
| 0.192000000000004 | 0.007 | 0.007 | 0.007 |
| 0.196000000000004 | 0.007 | 0.007 | 0.007 |
| 0.200000000000004 | 0.008 | 0.008 | 0.007 |
| 0.204000000000004 | 0.008 | 0.008 | 0.008 |
| 0.208000000000004 | 0.009 | 0.008 | 0.008 |
| 0.212000000000004 | 0.009 | 0.009 | 0.009 |
| 0.216000000000004 | 0.01 | 0.009 | 0.009 |
| 0.220000000000004 | 0.01 | 0.01 | 0.01 |
| 0.224000000000004 | 0.011 | 0.01 | 0.01 |
| 0.228000000000004 | 0.011 | 0.011 | 0.011 |
| 0.232000000000004 | 0.012 | 0.012 | 0.011 |
| 0.236000000000004 | 0.012 | 0.012 | 0.012 |
| 0.240000000000004 | 0.013 | 0.013 | 0.012 |
| 0.244000000000004 | 0.014 | 0.013 | 0.013 |
| 0.248000000000004 | 0.014 | 0.014 | 0.013 |
| 0.252000000000004 | 0.015 | 0.015 | 0.014 |
| 0.256000000000004 | 0.016 | 0.015 | 0.015 |
| 0.260000000000004 | 0.016 | 0.016 | 0.015 |
| 0.264000000000004 | 0.017 | 0.017 | 0.016 |
| 0.268000000000004 | 0.018 | 0.017 | 0.017 |
| 0.272000000000004 | 0.019 | 0.018 | 0.017 |
| 0.276000000000004 | 0.019 | 0.019 | 0.018 |
| 0.280000000000004 | 0.02 | 0.02 | 0.019 |
| 0.284000000000004 | 0.021 | 0.02 | 0.019 |
| 0.288000000000004 | 0.022 | 0.021 | 0.02 |
| 0.292000000000004 | 0.023 | 0.022 | 0.021 |
| 0.296000000000004 | 0.024 | 0.023 | 0.022 |
| 0.300000000000004 | 0.025 | 0.024 | 0.023 |
| 0.304000000000004 | 0.026 | 0.024 | 0.023 |
| 0.308000000000004 | 0.027 | 0.025 | 0.024 |
| 0.312000000000004 | 0.028 | 0.026 | 0.025 |
| 0.316000000000004 | 0.029 | 0.027 | 0.026 |
| 0.320000000000004 | 0.03 | 0.028 | 0.027 |
| 0.324000000000004 | 0.031 | 0.029 | 0.028 |
| 0.328000000000004 | 0.032 | 0.03 | 0.028 |
| 0.332000000000004 | 0.033 | 0.031 | 0.029 |
| 0.336000000000004 | 0.034 | 0.032 | 0.03 |
| 0.340000000000004 | 0.035 | 0.033 | 0.031 |
| 0.344000000000004 | 0.036 | 0.034 | 0.032 |
| 0.348000000000004 | 0.037 | 0.035 | 0.033 |
| 0.352000000000004 | 0.039 | 0.036 | 0.034 |
| 0.356000000000004 | 0.04 | 0.037 | 0.035 |
| 0.360000000000004 | 0.041 | 0.038 | 0.036 |
| 0.364000000000004 | 0.042 | 0.04 | 0.037 |
| 0.368000000000004 | 0.044 | 0.041 | 0.038 |
| 0.372000000000004 | 0.045 | 0.042 | 0.039 |
| 0.376000000000004 | 0.046 | 0.043 | 0.04 |
| 0.380000000000004 | 0.047 | 0.044 | 0.041 |
| 0.384000000000004 | 0.049 | 0.045 | 0.042 |
| 0.388000000000004 | 0.05 | 0.047 | 0.043 |
| 0.392000000000004 | 0.052 | 0.048 | 0.044 |
| 0.396000000000004 | 0.053 | 0.049 | 0.045 |
| 0.400000000000004 | 0.055 | 0.05 | 0.046 |
| 0.404000000000004 | 0.056 | 0.052 | 0.048 |
| 0.408000000000004 | 0.058 | 0.053 | 0.049 |
| 0.412000000000004 | 0.059 | 0.054 | 0.05 |
| 0.416000000000004 | 0.061 | 0.056 | 0.051 |
| 0.420000000000004 | 0.062 | 0.057 | 0.052 |
| 0.424000000000004 | 0.064 | 0.058 | 0.053 |
| 0.428000000000004 | 0.065 | 0.06 | 0.054 |
| 0.432000000000004 | 0.067 | 0.061 | 0.056 |
| 0.436000000000004 | 0.069 | 0.062 | 0.057 |
| 0.440000000000004 | 0.07 | 0.064 | 0.058 |
| 0.444000000000004 | 0.072 | 0.065 | 0.059 |
| 0.448000000000004 | 0.074 | 0.067 | 0.06 |
| 0.452000000000004 | 0.075 | 0.068 | 0.061 |
| 0.456000000000004 | 0.077 | 0.069 | 0.063 |
| 0.460000000000004 | 0.079 | 0.071 | 0.064 |
| 0.464000000000004 | 0.081 | 0.072 | 0.065 |
| 0.468000000000004 | 0.082 | 0.074 | 0.066 |
| 0.472000000000004 | 0.084 | 0.075 | 0.067 |
| 0.476000000000004 | 0.086 | 0.077 | 0.069 |
| 0.480000000000004 | 0.088 | 0.078 | 0.07 |
| 0.484000000000004 | 0.09 | 0.08 | 0.071 |
| 0.488000000000004 | 0.092 | 0.081 | 0.072 |
| 0.492000000000004 | 0.093 | 0.083 | 0.073 |
| 0.496000000000004 | 0.095 | 0.084 | 0.075 |
| 0.500000000000004 | 0.097 | 0.086 | 0.076 |
| 0.504000000000004 | 0.099 | 0.087 | 0.077 |
| 0.508000000000004 | 0.101 | 0.089 | 0.078 |
| 0.512000000000004 | 0.103 | 0.091 | 0.079 |
| 0.516000000000004 | 0.105 | 0.092 | 0.081 |
| 0.520000000000004 | 0.107 | 0.094 | 0.082 |
| 0.524000000000004 | 0.109 | 0.095 | 0.083 |
| 0.528000000000004 | 0.111 | 0.097 | 0.084 |
| 0.532000000000004 | 0.113 | 0.098 | 0.085 |
| 0.536000000000004 | 0.116 | 0.1 | 0.087 |
| 0.540000000000004 | 0.118 | 0.102 | 0.088 |
| 0.544000000000004 | 0.12 | 0.103 | 0.089 |
| 0.548000000000004 | 0.122 | 0.105 | 0.09 |
| 0.552000000000004 | 0.124 | 0.106 | 0.091 |
| 0.556000000000004 | 0.126 | 0.108 | 0.093 |
| 0.560000000000004 | 0.128 | 0.11 | 0.094 |
| 0.564000000000004 | 0.131 | 0.111 | 0.095 |
| 0.568000000000004 | 0.133 | 0.113 | 0.096 |
| 0.572000000000004 | 0.135 | 0.115 | 0.097 |
| 0.576000000000004 | 0.137 | 0.116 | 0.098 |
| 0.580000000000004 | 0.139 | 0.118 | 0.1 |
| 0.584000000000004 | 0.142 | 0.119 | 0.101 |
| 0.588000000000004 | 0.144 | 0.121 | 0.102 |
| 0.592000000000004 | 0.146 | 0.123 | 0.103 |
| 0.596000000000004 | 0.148 | 0.124 | 0.104 |
| 0.600000000000004 | 0.151 | 0.126 | 0.105 |
| 0.604000000000004 | 0.153 | 0.127 | 0.106 |
| 0.608000000000004 | 0.155 | 0.129 | 0.107 |
| 0.612000000000004 | 0.158 | 0.131 | 0.108 |
| 0.616000000000004 | 0.16 | 0.132 | 0.109 |
| 0.620000000000004 | 0.162 | 0.134 | 0.11 |
| 0.624000000000004 | 0.165 | 0.135 | 0.112 |
| 0.628000000000004 | 0.167 | 0.137 | 0.113 |
| 0.632000000000004 | 0.169 | 0.139 | 0.114 |
| 0.636000000000004 | 0.172 | 0.14 | 0.115 |
| 0.640000000000004 | 0.174 | 0.142 | 0.116 |
| 0.644000000000004 | 0.176 | 0.143 | 0.117 |
| 0.648000000000004 | 0.179 | 0.145 | 0.117 |
| 0.652000000000004 | 0.181 | 0.146 | 0.118 |
| 0.656000000000004 | 0.184 | 0.148 | 0.119 |
| 0.660000000000004 | 0.186 | 0.15 | 0.12 |
| 0.664000000000004 | 0.188 | 0.151 | 0.121 |
| 0.668000000000004 | 0.191 | 0.153 | 0.122 |
| 0.672000000000004 | 0.193 | 0.154 | 0.123 |
| 0.676000000000004 | 0.196 | 0.156 | 0.124 |
| 0.680000000000004 | 0.198 | 0.157 | 0.125 |
| 0.684000000000004 | 0.2 | 0.159 | 0.126 |
| 0.688000000000004 | 0.203 | 0.16 | 0.126 |
| 0.692000000000004 | 0.205 | 0.162 | 0.127 |
| 0.696000000000004 | 0.208 | 0.163 | 0.128 |
| 0.700000000000004 | 0.21 | 0.164 | 0.129 |
| 0.704000000000004 | 0.213 | 0.166 | 0.129 |
| 0.708000000000004 | 0.215 | 0.167 | 0.13 |
| 0.712000000000004 | 0.217 | 0.169 | 0.131 |
| 0.716000000000004 | 0.22 | 0.17 | 0.132 |
| 0.720000000000004 | 0.222 | 0.172 | 0.132 |
| 0.724000000000004 | 0.225 | 0.173 | 0.133 |
| 0.728000000000004 | 0.227 | 0.174 | 0.134 |
| 0.732000000000004 | 0.23 | 0.176 | 0.134 |
| 0.736000000000004 | 0.232 | 0.177 | 0.135 |
| 0.740000000000004 | 0.234 | 0.178 | 0.136 |
| 0.744000000000004 | 0.237 | 0.18 | 0.136 |
| 0.748000000000004 | 0.239 | 0.181 | 0.137 |
| 0.752000000000004 | 0.242 | 0.182 | 0.137 |
| 0.756000000000004 | 0.244 | 0.183 | 0.138 |
| 0.760000000000004 | 0.246 | 0.185 | 0.138 |
| 0.764000000000004 | 0.249 | 0.186 | 0.139 |
| 0.768000000000004 | 0.251 | 0.187 | 0.139 |
| 0.772000000000004 | 0.254 | 0.188 | 0.14 |
| 0.776000000000004 | 0.256 | 0.189 | 0.14 |
| 0.780000000000004 | 0.258 | 0.191 | 0.141 |
| 0.784000000000004 | 0.261 | 0.192 | 0.141 |
| 0.788000000000004 | 0.263 | 0.193 | 0.141 |
| 0.792000000000004 | 0.265 | 0.194 | 0.142 |
| 0.796000000000004 | 0.268 | 0.195 | 0.142 |
| 0.800000000000004 | 0.27 | 0.196 | 0.142 |
| 0.804000000000004 | 0.272 | 0.197 | 0.143 |
| 0.808000000000004 | 0.275 | 0.198 | 0.143 |
| 0.812000000000004 | 0.277 | 0.199 | 0.143 |
| 0.816000000000004 | 0.279 | 0.2 | 0.143 |
| 0.820000000000004 | 0.281 | 0.201 | 0.144 |
| 0.824000000000004 | 0.284 | 0.202 | 0.144 |
| 0.828000000000004 | 0.286 | 0.203 | 0.144 |
| 0.832000000000004 | 0.288 | 0.204 | 0.144 |
| 0.836000000000004 | 0.29 | 0.205 | 0.144 |
| 0.840000000000004 | 0.293 | 0.206 | 0.145 |
| 0.844000000000004 | 0.295 | 0.207 | 0.145 |
| 0.848000000000004 | 0.297 | 0.207 | 0.145 |
| 0.852000000000004 | 0.299 | 0.208 | 0.145 |
| 0.856000000000004 | 0.301 | 0.209 | 0.145 |
| 0.860000000000004 | 0.304 | 0.21 | 0.145 |
| 0.864000000000004 | 0.306 | 0.21 | 0.145 |
| 0.868000000000004 | 0.308 | 0.211 | 0.145 |
| 0.872000000000004 | 0.31 | 0.212 | 0.145 |
| 0.876000000000004 | 0.312 | 0.213 | 0.145 |
| 0.880000000000004 | 0.314 | 0.213 | 0.145 |
| 0.884000000000004 | 0.316 | 0.214 | 0.145 |
| 0.888000000000004 | 0.318 | 0.215 | 0.145 |
| 0.892000000000004 | 0.32 | 0.215 | 0.145 |
| 0.896000000000004 | 0.322 | 0.216 | 0.144 |
| 0.900000000000004 | 0.324 | 0.216 | 0.144 |
| 0.904000000000004 | 0.326 | 0.217 | 0.144 |
| 0.908000000000004 | 0.328 | 0.217 | 0.144 |
| 0.912000000000004 | 0.33 | 0.218 | 0.144 |
| 0.916000000000004 | 0.332 | 0.218 | 0.144 |
| 0.920000000000004 | 0.334 | 0.219 | 0.143 |
| 0.924000000000004 | 0.336 | 0.219 | 0.143 |
| 0.928000000000004 | 0.338 | 0.22 | 0.143 |
| 0.932000000000004 | 0.34 | 0.22 | 0.142 |
| 0.936000000000004 | 0.341 | 0.22 | 0.142 |
| 0.940000000000004 | 0.343 | 0.221 | 0.142 |
| 0.944000000000004 | 0.345 | 0.221 | 0.142 |
| 0.948000000000004 | 0.347 | 0.221 | 0.141 |
| 0.952000000000004 | 0.349 | 0.222 | 0.141 |
| 0.956000000000004 | 0.35 | 0.222 | 0.14 |
| 0.960000000000004 | 0.352 | 0.222 | 0.14 |
| 0.964000000000004 | 0.354 | 0.222 | 0.14 |
| 0.968000000000004 | 0.355 | 0.222 | 0.139 |
| 0.972000000000004 | 0.357 | 0.223 | 0.139 |
| 0.976000000000004 | 0.359 | 0.223 | 0.138 |
| 0.980000000000004 | 0.36 | 0.223 | 0.138 |
| 0.984000000000004 | 0.362 | 0.223 | 0.137 |
| 0.988000000000004 | 0.363 | 0.223 | 0.137 |
| 0.992000000000004 | 0.365 | 0.223 | 0.136 |
| 0.996000000000004 | 0.366 | 0.223 | 0.136 |
| 1.000000000000004 | 0.368 | 0.223 | 0.135 |
| 1.004000000000004 | 0.369 | 0.223 | 0.135 |
| 1.008000000000004 | 0.371 | 0.223 | 0.134 |
| 1.012000000000004 | 0.372 | 0.223 | 0.134 |
| 1.016000000000004 | 0.374 | 0.223 | 0.133 |
| 1.020000000000004 | 0.375 | 0.223 | 0.132 |
| 1.024000000000004 | 0.376 | 0.223 | 0.132 |
| 1.028000000000004 | 0.378 | 0.223 | 0.131 |
| 1.032000000000004 | 0.379 | 0.222 | 0.131 |
| 1.036000000000004 | 0.38 | 0.222 | 0.13 |
| 1.040000000000004 | 0.381 | 0.222 | 0.129 |
| 1.044000000000004 | 0.383 | 0.222 | 0.129 |
| 1.048000000000004 | 0.384 | 0.222 | 0.128 |
| 1.052000000000004 | 0.385 | 0.221 | 0.127 |
| 1.056000000000004 | 0.386 | 0.221 | 0.127 |
| 1.060000000000004 | 0.387 | 0.221 | 0.126 |
| 1.064000000000004 | 0.388 | 0.22 | 0.125 |
| 1.068000000000004 | 0.389 | 0.22 | 0.124 |
| 1.072000000000004 | 0.39 | 0.22 | 0.124 |
| 1.076000000000004 | 0.391 | 0.219 | 0.123 |
| 1.080000000000004 | 0.392 | 0.219 | 0.122 |
| 1.084000000000004 | 0.393 | 0.219 | 0.121 |
| 1.088000000000004 | 0.394 | 0.218 | 0.121 |
| 1.092000000000004 | 0.395 | 0.218 | 0.12 |
| 1.096000000000004 | 0.396 | 0.217 | 0.119 |
| 1.100000000000004 | 0.397 | 0.217 | 0.118 |
| 1.104000000000004 | 0.398 | 0.216 | 0.118 |
| 1.108000000000004 | 0.399 | 0.216 | 0.117 |
| 1.112000000000004 | 0.399 | 0.215 | 0.116 |
| 1.116000000000004 | 0.4 | 0.215 | 0.115 |
| 1.120000000000004 | 0.401 | 0.214 | 0.114 |
| 1.124000000000004 | 0.401 | 0.213 | 0.113 |
| 1.128000000000004 | 0.402 | 0.213 | 0.113 |
| 1.132000000000004 | 0.403 | 0.212 | 0.112 |
| 1.136000000000004 | 0.403 | 0.212 | 0.111 |
| 1.140000000000004 | 0.404 | 0.211 | 0.11 |
| 1.144000000000004 | 0.404 | 0.21 | 0.109 |
| 1.148000000000004 | 0.405 | 0.21 | 0.108 |
| 1.152000000000004 | 0.406 | 0.209 | 0.108 |
| 1.156000000000004 | 0.406 | 0.208 | 0.107 |
| 1.160000000000004 | 0.406 | 0.207 | 0.106 |
| 1.164000000000004 | 0.407 | 0.207 | 0.105 |
| 1.168000000000004 | 0.407 | 0.206 | 0.104 |
| 1.172000000000004 | 0.408 | 0.205 | 0.103 |
| 1.176000000000004 | 0.408 | 0.204 | 0.102 |
| 1.180000000000004 | 0.408 | 0.204 | 0.101 |
| 1.184000000000004 | 0.409 | 0.203 | 0.101 |
| 1.188000000000004 | 0.409 | 0.202 | 0.1 |
| 1.192000000000004 | 0.409 | 0.201 | 0.099 |
| 1.196000000000004 | 0.409 | 0.2 | 0.098 |
| 1.200000000000004 | 0.409 | 0.199 | 0.097 |
| 1.204000000000004 | 0.41 | 0.198 | 0.096 |
| 1.208000000000004 | 0.41 | 0.198 | 0.095 |
| 1.212000000000004 | 0.41 | 0.197 | 0.094 |
| 1.216000000000004 | 0.41 | 0.196 | 0.093 |
| 1.220000000000004 | 0.41 | 0.195 | 0.093 |
| 1.224000000000004 | 0.41 | 0.194 | 0.092 |
| 1.228000000000004 | 0.41 | 0.193 | 0.091 |
| 1.232000000000004 | 0.41 | 0.192 | 0.09 |
| 1.236000000000004 | 0.41 | 0.191 | 0.089 |
| 1.240000000000004 | 0.41 | 0.19 | 0.088 |
| 1.244000000000004 | 0.41 | 0.189 | 0.087 |
| 1.248000000000004 | 0.409 | 0.188 | 0.086 |
| 1.252000000000004 | 0.409 | 0.187 | 0.085 |
| 1.256000000000004 | 0.409 | 0.186 | 0.084 |
| 1.260000000000004 | 0.409 | 0.185 | 0.084 |
| 1.264000000000004 | 0.409 | 0.184 | 0.083 |
| 1.268000000000004 | 0.408 | 0.183 | 0.082 |
| 1.272000000000004 | 0.408 | 0.182 | 0.081 |
| 1.276000000000004 | 0.408 | 0.181 | 0.08 |
| 1.280000000000004 | 0.407 | 0.18 | 0.079 |
| 1.284000000000004 | 0.407 | 0.179 | 0.078 |
| 1.288000000000004 | 0.407 | 0.177 | 0.077 |
| 1.292000000000004 | 0.406 | 0.176 | 0.077 |
| 1.296000000000004 | 0.406 | 0.175 | 0.076 |
| 1.300000000000004 | 0.405 | 0.174 | 0.075 |
| 1.304000000000004 | 0.405 | 0.173 | 0.074 |
| 1.308000000000004 | 0.404 | 0.172 | 0.073 |
| 1.312000000000004 | 0.404 | 0.171 | 0.072 |
| 1.316000000000004 | 0.403 | 0.17 | 0.071 |
| 1.320000000000004 | 0.403 | 0.169 | 0.071 |
| 1.324000000000004 | 0.402 | 0.167 | 0.07 |
| 1.328000000000004 | 0.401 | 0.166 | 0.069 |
| 1.332000000000004 | 0.401 | 0.165 | 0.068 |
| 1.336000000000004 | 0.4 | 0.164 | 0.067 |
| 1.340000000000004 | 0.399 | 0.163 | 0.066 |
| 1.344000000000004 | 0.399 | 0.162 | 0.065 |
| 1.348000000000004 | 0.398 | 0.16 | 0.065 |
| 1.352000000000004 | 0.397 | 0.159 | 0.064 |
| 1.356000000000004 | 0.396 | 0.158 | 0.063 |
| 1.360000000000004 | 0.396 | 0.157 | 0.062 |
| 1.364000000000004 | 0.395 | 0.156 | 0.061 |
| 1.368000000000004 | 0.394 | 0.155 | 0.061 |
| 1.372000000000004 | 0.393 | 0.153 | 0.06 |
| 1.376000000000004 | 0.392 | 0.152 | 0.059 |
| 1.380000000000004 | 0.391 | 0.151 | 0.058 |
| 1.384000000000004 | 0.39 | 0.15 | 0.057 |
| 1.388000000000005 | 0.389 | 0.149 | 0.057 |
| 1.392000000000004 | 0.389 | 0.147 | 0.056 |
| 1.396000000000004 | 0.388 | 0.146 | 0.055 |
| 1.400000000000005 | 0.387 | 0.145 | 0.054 |
| 1.404000000000005 | 0.385 | 0.144 | 0.054 |
| 1.408000000000005 | 0.384 | 0.143 | 0.053 |
| 1.412000000000005 | 0.383 | 0.141 | 0.052 |
| 1.416000000000005 | 0.382 | 0.14 | 0.051 |
| 1.420000000000005 | 0.381 | 0.139 | 0.051 |
| 1.424000000000005 | 0.38 | 0.138 | 0.05 |
| 1.428000000000005 | 0.379 | 0.137 | 0.049 |
| 1.432000000000005 | 0.378 | 0.136 | 0.049 |
| 1.436000000000005 | 0.377 | 0.134 | 0.048 |
| 1.440000000000005 | 0.375 | 0.133 | 0.047 |
| 1.444000000000005 | 0.374 | 0.132 | 0.047 |
| 1.448000000000005 | 0.373 | 0.131 | 0.046 |
| 1.452000000000005 | 0.372 | 0.13 | 0.045 |
| 1.456000000000005 | 0.371 | 0.128 | 0.044 |
| 1.460000000000005 | 0.369 | 0.127 | 0.044 |
| 1.464000000000005 | 0.368 | 0.126 | 0.043 |
| 1.468000000000005 | 0.367 | 0.125 | 0.042 |
| 1.472000000000005 | 0.365 | 0.124 | 0.042 |
| 1.476000000000005 | 0.364 | 0.122 | 0.041 |
| 1.480000000000005 | 0.363 | 0.121 | 0.041 |
| 1.484000000000005 | 0.361 | 0.12 | 0.04 |
| 1.488000000000005 | 0.36 | 0.119 | 0.039 |
| 1.492000000000005 | 0.359 | 0.118 | 0.039 |
| 1.496000000000005 | 0.357 | 0.117 | 0.038 |
| 1.500000000000005 | 0.356 | 0.115 | 0.037 |
| 1.504000000000005 | 0.354 | 0.114 | 0.037 |
| 1.508000000000005 | 0.353 | 0.113 | 0.036 |
| 1.512000000000005 | 0.351 | 0.112 | 0.036 |
| 1.516000000000005 | 0.35 | 0.111 | 0.035 |
| 1.520000000000005 | 0.348 | 0.11 | 0.035 |
| 1.524000000000005 | 0.347 | 0.109 | 0.034 |
| 1.528000000000005 | 0.345 | 0.107 | 0.033 |
| 1.532000000000005 | 0.344 | 0.106 | 0.033 |
| 1.536000000000005 | 0.342 | 0.105 | 0.032 |
| 1.540000000000005 | 0.341 | 0.104 | 0.032 |
| 1.544000000000005 | 0.339 | 0.103 | 0.031 |
| 1.548000000000005 | 0.338 | 0.102 | 0.031 |
| 1.552000000000005 | 0.336 | 0.101 | 0.03 |
| 1.556000000000005 | 0.335 | 0.1 | 0.03 |
| 1.560000000000005 | 0.333 | 0.099 | 0.029 |
| 1.564000000000005 | 0.331 | 0.098 | 0.029 |
| 1.568000000000005 | 0.33 | 0.096 | 0.028 |
| 1.572000000000005 | 0.328 | 0.095 | 0.028 |
| 1.576000000000005 | 0.327 | 0.094 | 0.027 |
| 1.580000000000005 | 0.325 | 0.093 | 0.027 |
| 1.584000000000005 | 0.323 | 0.092 | 0.026 |
| 1.588000000000005 | 0.322 | 0.091 | 0.026 |
| 1.592000000000005 | 0.32 | 0.09 | 0.025 |
| 1.596000000000005 | 0.318 | 0.089 | 0.025 |
| 1.600000000000005 | 0.317 | 0.088 | 0.024 |
| 1.604000000000005 | 0.315 | 0.087 | 0.024 |
| 1.608000000000005 | 0.313 | 0.086 | 0.024 |
| 1.612000000000005 | 0.312 | 0.085 | 0.023 |
| 1.616000000000005 | 0.31 | 0.084 | 0.023 |
| 1.620000000000005 | 0.308 | 0.083 | 0.022 |
| 1.624000000000005 | 0.306 | 0.082 | 0.022 |
| 1.628000000000005 | 0.305 | 0.081 | 0.022 |
| 1.632000000000005 | 0.303 | 0.08 | 0.021 |
| 1.636000000000005 | 0.301 | 0.079 | 0.021 |
| 1.640000000000005 | 0.3 | 0.078 | 0.02 |
| 1.644000000000005 | 0.298 | 0.077 | 0.02 |
| 1.648000000000005 | 0.296 | 0.076 | 0.02 |
| 1.652000000000005 | 0.294 | 0.075 | 0.019 |
| 1.656000000000005 | 0.293 | 0.074 | 0.019 |
| 1.660000000000005 | 0.291 | 0.073 | 0.018 |
| 1.664000000000005 | 0.289 | 0.072 | 0.018 |
| 1.668000000000005 | 0.287 | 0.071 | 0.018 |
| 1.672000000000005 | 0.285 | 0.071 | 0.017 |
| 1.676000000000005 | 0.284 | 0.07 | 0.017 |
| 1.680000000000005 | 0.282 | 0.069 | 0.017 |
| 1.684000000000005 | 0.28 | 0.068 | 0.016 |
| 1.688000000000005 | 0.278 | 0.067 | 0.016 |
| 1.692000000000005 | 0.277 | 0.066 | 0.016 |
| 1.696000000000005 | 0.275 | 0.065 | 0.015 |
| 1.700000000000005 | 0.273 | 0.064 | 0.015 |
| 1.704000000000005 | 0.271 | 0.064 | 0.015 |
| 1.708000000000005 | 0.269 | 0.063 | 0.015 |
| 1.712000000000005 | 0.268 | 0.062 | 0.014 |
| 1.716000000000005 | 0.266 | 0.061 | 0.014 |
| 1.720000000000005 | 0.264 | 0.06 | 0.014 |
| 1.724000000000005 | 0.262 | 0.059 | 0.013 |
| 1.728000000000005 | 0.261 | 0.059 | 0.013 |
| 1.732000000000005 | 0.259 | 0.058 | 0.013 |
| 1.736000000000005 | 0.257 | 0.057 | 0.013 |
| 1.740000000000005 | 0.255 | 0.056 | 0.012 |
| 1.744000000000005 | 0.253 | 0.055 | 0.012 |
| 1.748000000000005 | 0.252 | 0.055 | 0.012 |
| 1.752000000000005 | 0.25 | 0.054 | 0.012 |
| 1.756000000000005 | 0.248 | 0.053 | 0.011 |
| 1.760000000000005 | 0.246 | 0.052 | 0.011 |
| 1.764000000000005 | 0.244 | 0.052 | 0.011 |
| 1.768000000000005 | 0.243 | 0.051 | 0.011 |
| 1.772000000000005 | 0.241 | 0.05 | 0.01 |
| 1.776000000000005 | 0.239 | 0.049 | 0.01 |
| 1.780000000000005 | 0.237 | 0.049 | 0.01 |
| 1.784000000000005 | 0.235 | 0.048 | 0.01 |
| 1.788000000000005 | 0.234 | 0.047 | 0.01 |
| 1.792000000000005 | 0.232 | 0.047 | 0.009 |
| 1.796000000000005 | 0.23 | 0.046 | 0.009 |
| 1.800000000000005 | 0.228 | 0.045 | 0.009 |
| 1.804000000000005 | 0.227 | 0.045 | 0.009 |
| 1.808000000000005 | 0.225 | 0.044 | 0.009 |
| 1.812000000000005 | 0.223 | 0.043 | 0.008 |
| 1.816000000000005 | 0.221 | 0.043 | 0.008 |
| 1.820000000000005 | 0.22 | 0.042 | 0.008 |
| 1.824000000000005 | 0.218 | 0.041 | 0.008 |
| 1.828000000000005 | 0.216 | 0.041 | 0.008 |
| 1.832000000000005 | 0.214 | 0.04 | 0.007 |
| 1.836000000000005 | 0.213 | 0.039 | 0.007 |
| 1.840000000000005 | 0.211 | 0.039 | 0.007 |
| 1.844000000000005 | 0.209 | 0.038 | 0.007 |
| 1.848000000000005 | 0.207 | 0.038 | 0.007 |
| 1.852000000000005 | 0.206 | 0.037 | 0.007 |
| 1.856000000000005 | 0.204 | 0.036 | 0.007 |
| 1.860000000000005 | 0.202 | 0.036 | 0.006 |
| 1.864000000000005 | 0.201 | 0.035 | 0.006 |
| 1.868000000000005 | 0.199 | 0.035 | 0.006 |
| 1.872000000000005 | 0.197 | 0.034 | 0.006 |
| 1.876000000000005 | 0.196 | 0.034 | 0.006 |
| 1.880000000000005 | 0.194 | 0.033 | 0.006 |
| 1.884000000000005 | 0.192 | 0.033 | 0.006 |
| 1.888000000000005 | 0.191 | 0.032 | 0.005 |
| 1.892000000000005 | 0.189 | 0.032 | 0.005 |
| 1.896000000000005 | 0.187 | 0.031 | 0.005 |
| 1.900000000000005 | 0.186 | 0.031 | 0.005 |
| 1.904000000000005 | 0.184 | 0.03 | 0.005 |
| 1.908000000000005 | 0.182 | 0.03 | 0.005 |
| 1.912000000000005 | 0.181 | 0.029 | 0.005 |
| 1.916000000000005 | 0.179 | 0.029 | 0.005 |
| 1.920000000000005 | 0.177 | 0.028 | 0.004 |
| 1.924000000000005 | 0.176 | 0.028 | 0.004 |
| 1.928000000000005 | 0.174 | 0.027 | 0.004 |
| 1.932000000000005 | 0.173 | 0.027 | 0.004 |
| 1.936000000000005 | 0.171 | 0.026 | 0.004 |
| 1.940000000000005 | 0.169 | 0.026 | 0.004 |
| 1.944000000000005 | 0.168 | 0.025 | 0.004 |
| 1.948000000000005 | 0.166 | 0.025 | 0.004 |
| 1.952000000000005 | 0.165 | 0.025 | 0.004 |
| 1.956000000000005 | 0.163 | 0.024 | 0.004 |
| 1.960000000000005 | 0.162 | 0.024 | 0.003 |
| 1.964000000000005 | 0.16 | 0.023 | 0.003 |
| 1.968000000000005 | 0.159 | 0.023 | 0.003 |
| 1.972000000000005 | 0.157 | 0.022 | 0.003 |
| 1.976000000000005 | 0.155 | 0.022 | 0.003 |
| 1.980000000000005 | 0.154 | 0.022 | 0.003 |
| 1.984000000000005 | 0.152 | 0.021 | 0.003 |
| 1.988000000000005 | 0.151 | 0.021 | 0.003 |
| 1.992000000000005 | 0.149 | 0.021 | 0.003 |
| 1.996000000000005 | 0.148 | 0.02 | 0.003 |
| 2.000000000000005 | 0.147 | 0.02 | 0.003 |
| 2.004000000000005 | 0.145 | 0.019 | 0.003 |
| 2.008000000000005 | 0.144 | 0.019 | 0.003 |
| 2.012000000000005 | 0.142 | 0.019 | 0.002 |
| 2.016000000000005 | 0.141 | 0.018 | 0.002 |
| 2.020000000000005 | 0.139 | 0.018 | 0.002 |
| 2.024000000000005 | 0.138 | 0.018 | 0.002 |
| 2.028000000000005 | 0.136 | 0.017 | 0.002 |
| 2.032000000000005 | 0.135 | 0.017 | 0.002 |
| 2.036000000000005 | 0.134 | 0.017 | 0.002 |
| 2.040000000000005 | 0.132 | 0.017 | 0.002 |
| 2.044000000000005 | 0.131 | 0.016 | 0.002 |
| 2.048000000000005 | 0.13 | 0.016 | 0.002 |
| 2.052000000000005 | 0.128 | 0.016 | 0.002 |
| 2.056000000000005 | 0.127 | 0.015 | 0.002 |
| 2.060000000000005 | 0.125 | 0.015 | 0.002 |
| 2.064000000000005 | 0.124 | 0.015 | 0.002 |
| 2.068000000000005 | 0.123 | 0.014 | 0.002 |
| 2.072000000000005 | 0.122 | 0.014 | 0.002 |
| 2.076000000000005 | 0.12 | 0.014 | 0.002 |
| 2.080000000000005 | 0.119 | 0.014 | 0.002 |
| 2.084000000000005 | 0.118 | 0.013 | 0.002 |
| 2.088000000000005 | 0.116 | 0.013 | 0.001 |
| 2.092000000000005 | 0.115 | 0.013 | 0.001 |
| 2.096000000000005 | 0.114 | 0.013 | 0.001 |
| 2.100000000000005 | 0.113 | 0.012 | 0.001 |
| 2.104000000000005 | 0.111 | 0.012 | 0.001 |
| 2.108000000000005 | 0.11 | 0.012 | 0.001 |
| 2.112000000000005 | 0.109 | 0.012 | 0.001 |
| 2.116000000000005 | 0.108 | 0.011 | 0.001 |
| 2.120000000000005 | 0.106 | 0.011 | 0.001 |
| 2.124000000000005 | 0.105 | 0.011 | 0.001 |
| 2.128000000000005 | 0.104 | 0.011 | 0.001 |
| 2.132000000000005 | 0.103 | 0.011 | 0.001 |
| 2.136000000000005 | 0.102 | 0.01 | 0.001 |
| 2.140000000000005 | 0.101 | 0.01 | 0.001 |
| 2.144000000000005 | 0.099 | 0.01 | 0.001 |
| 2.148000000000005 | 0.098 | 0.01 | 0.001 |
| 2.152000000000005 | 0.097 | 0.01 | 0.001 |
| 2.156000000000005 | 0.096 | 0.009 | 0.001 |
| 2.160000000000005 | 0.095 | 0.009 | 0.001 |
| 2.164000000000005 | 0.094 | 0.009 | 0.001 |
| 2.168000000000005 | 0.093 | 0.009 | 0.001 |
| 2.172000000000005 | 0.092 | 0.009 | 0.001 |
| 2.176000000000005 | 0.09 | 0.008 | 0.001 |
| 2.180000000000005 | 0.089 | 0.008 | 0.001 |
| 2.184000000000005 | 0.088 | 0.008 | 0.001 |
| 2.188000000000005 | 0.087 | 0.008 | 0.001 |
| 2.192000000000005 | 0.086 | 0.008 | 0.001 |
| 2.196000000000005 | 0.085 | 0.008 | 0.001 |
| 2.200000000000005 | 0.084 | 0.007 | 0.001 |
| 2.204000000000005 | 0.083 | 0.007 | 0.001 |
| 2.208000000000005 | 0.082 | 0.007 | 0.001 |
| 2.212000000000005 | 0.081 | 0.007 | 0.001 |
| 2.216000000000005 | 0.08 | 0.007 | 0.001 |
| 2.220000000000005 | 0.079 | 0.007 | 0.001 |
| 2.224000000000005 | 0.078 | 0.007 | 0.001 |
| 2.228000000000005 | 0.077 | 0.006 | 0.001 |
| 2.232000000000005 | 0.076 | 0.006 | 0.001 |
| 2.236000000000005 | 0.075 | 0.006 | 0.001 |
| 2.240000000000005 | 0.074 | 0.006 | 0 |
| 2.244000000000005 | 0.073 | 0.006 | 0 |
| 2.248000000000005 | 0.073 | 0.006 | 0 |
| 2.252000000000005 | 0.072 | 0.006 | 0 |
| 2.256000000000005 | 0.071 | 0.006 | 0 |
| 2.260000000000005 | 0.07 | 0.005 | 0 |
| 2.264000000000005 | 0.069 | 0.005 | 0 |
| 2.268000000000005 | 0.068 | 0.005 | 0 |
| 2.272000000000005 | 0.067 | 0.005 | 0 |
| 2.276000000000005 | 0.066 | 0.005 | 0 |
| 2.280000000000005 | 0.065 | 0.005 | 0 |
| 2.284000000000005 | 0.065 | 0.005 | 0 |
| 2.288000000000005 | 0.064 | 0.005 | 0 |
| 2.292000000000005 | 0.063 | 0.005 | 0 |
| 2.296000000000005 | 0.062 | 0.004 | 0 |
| 2.300000000000005 | 0.061 | 0.004 | 0 |
| 2.304000000000005 | 0.061 | 0.004 | 0 |
| 2.308000000000005 | 0.06 | 0.004 | 0 |
| 2.312000000000005 | 0.059 | 0.004 | 0 |
| 2.316000000000005 | 0.058 | 0.004 | 0 |
| 2.320000000000005 | 0.057 | 0.004 | 0 |
| 2.324000000000005 | 0.057 | 0.004 | 0 |
| 2.328000000000005 | 0.056 | 0.004 | 0 |
| 2.332000000000005 | 0.055 | 0.004 | 0 |
| 2.336000000000005 | 0.054 | 0.004 | 0 |
| 2.340000000000005 | 0.054 | 0.003 | 0 |
| 2.344000000000005 | 0.053 | 0.003 | 0 |
| 2.348000000000005 | 0.052 | 0.003 | 0 |
| 2.352000000000005 | 0.052 | 0.003 | 0 |
| 2.356000000000005 | 0.051 | 0.003 | 0 |
| 2.360000000000005 | 0.05 | 0.003 | 0 |
| 2.364000000000005 | 0.049 | 0.003 | 0 |
| 2.368000000000005 | 0.049 | 0.003 | 0 |
| 2.372000000000005 | 0.048 | 0.003 | 0 |
| 2.376000000000005 | 0.047 | 0.003 | 0 |
| 2.380000000000005 | 0.047 | 0.003 | 0 |
| 2.384000000000005 | 0.046 | 0.003 | 0 |
| 2.388000000000005 | 0.045 | 0.003 | 0 |
| 2.392000000000005 | 0.045 | 0.003 | 0 |
| 2.396000000000005 | 0.044 | 0.003 | 0 |
| 2.400000000000005 | 0.044 | 0.002 | 0 |
| 2.404000000000005 | 0.043 | 0.002 | 0 |
| 2.408000000000005 | 0.042 | 0.002 | 0 |
| 2.412000000000005 | 0.042 | 0.002 | 0 |
| 2.416000000000005 | 0.041 | 0.002 | 0 |
| 2.420000000000005 | 0.041 | 0.002 | 0 |
| 2.424000000000005 | 0.04 | 0.002 | 0 |
| 2.428000000000005 | 0.039 | 0.002 | 0 |
| 2.432000000000005 | 0.039 | 0.002 | 0 |
| 2.436000000000005 | 0.038 | 0.002 | 0 |
| 2.440000000000005 | 0.038 | 0.002 | 0 |
| 2.444000000000005 | 0.037 | 0.002 | 0 |
| 2.448000000000005 | 0.037 | 0.002 | 0 |
| 2.452000000000005 | 0.036 | 0.002 | 0 |
| 2.456000000000005 | 0.036 | 0.002 | 0 |
| 2.460000000000005 | 0.035 | 0.002 | 0 |
| 2.464000000000005 | 0.035 | 0.002 | 0 |
| 2.468000000000005 | 0.034 | 0.002 | 0 |
| 2.472000000000005 | 0.034 | 0.002 | 0 |
| 2.476000000000005 | 0.033 | 0.002 | 0 |
| 2.480000000000005 | 0.033 | 0.002 | 0 |
| 2.484000000000005 | 0.032 | 0.001 | 0 |
| 2.488000000000005 | 0.032 | 0.001 | 0 |
| 2.492000000000005 | 0.031 | 0.001 | 0 |
| 2.496000000000005 | 0.031 | 0.001 | 0 |
| 2.500000000000005 | 0.03 | 0.001 | 0 |
| 2.504000000000005 | 0.03 | 0.001 | 0 |
| 2.508000000000005 | 0.029 | 0.001 | 0 |
| 2.512000000000005 | 0.029 | 0.001 | 0 |
| 2.516000000000005 | 0.028 | 0.001 | 0 |
| 2.520000000000005 | 0.028 | 0.001 | 0 |
| 2.524000000000005 | 0.028 | 0.001 | 0 |
| 2.528000000000005 | 0.027 | 0.001 | 0 |
| 2.532000000000005 | 0.027 | 0.001 | 0 |
| 2.536000000000005 | 0.026 | 0.001 | 0 |
| 2.540000000000005 | 0.026 | 0.001 | 0 |
| 2.544000000000005 | 0.025 | 0.001 | 0 |
| 2.548000000000005 | 0.025 | 0.001 | 0 |
| 2.552000000000005 | 0.025 | 0.001 | 0 |
| 2.556000000000005 | 0.024 | 0.001 | 0 |
| 2.560000000000005 | 0.024 | 0.001 | 0 |
| 2.564000000000005 | 0.024 | 0.001 | 0 |
| 2.568000000000005 | 0.023 | 0.001 | 0 |
| 2.572000000000005 | 0.023 | 0.001 | 0 |
| 2.576000000000005 | 0.022 | 0.001 | 0 |
| 2.580000000000005 | 0.022 | 0.001 | 0 |
| 2.584000000000005 | 0.022 | 0.001 | 0 |
| 2.588000000000005 | 0.021 | 0.001 | 0 |
| 2.592000000000005 | 0.021 | 0.001 | 0 |
| 2.596000000000005 | 0.021 | 0.001 | 0 |
| 2.600000000000005 | 0.02 | 0.001 | 0 |
| 2.604000000000005 | 0.02 | 0.001 | 0 |
| 2.608000000000005 | 0.02 | 0.001 | 0 |
| 2.612000000000005 | 0.019 | 0.001 | 0 |
| 2.616000000000005 | 0.019 | 0.001 | 0 |
| 2.620000000000005 | 0.019 | 0.001 | 0 |
| 2.624000000000005 | 0.018 | 0.001 | 0 |
| 2.628000000000005 | 0.018 | 0.001 | 0 |
| 2.632000000000005 | 0.018 | 0.001 | 0 |
| 2.636000000000005 | 0.018 | 0.001 | 0 |
| 2.640000000000005 | 0.017 | 0.001 | 0 |
| 2.644000000000005 | 0.017 | 0.001 | 0 |
| 2.648000000000005 | 0.017 | 0.001 | 0 |
| 2.652000000000005 | 0.016 | 0 | 0 |
| 2.656000000000005 | 0.016 | 0 | 0 |
| 2.660000000000005 | 0.016 | 0 | 0 |
| 2.664000000000005 | 0.016 | 0 | 0 |
| 2.668000000000005 | 0.015 | 0 | 0 |
| 2.672000000000005 | 0.015 | 0 | 0 |
| 2.676000000000005 | 0.015 | 0 | 0 |
| 2.680000000000005 | 0.015 | 0 | 0 |
| 2.684000000000005 | 0.014 | 0 | 0 |
| 2.688000000000005 | 0.014 | 0 | 0 |
| 2.692000000000005 | 0.014 | 0 | 0 |
| 2.696000000000005 | 0.014 | 0 | 0 |
| 2.700000000000005 | 0.013 | 0 | 0 |
| 2.704000000000005 | 0.013 | 0 | 0 |
| 2.708000000000005 | 0.013 | 0 | 0 |
| 2.712000000000005 | 0.013 | 0 | 0 |
| 2.716000000000005 | 0.013 | 0 | 0 |
| 2.720000000000005 | 0.012 | 0 | 0 |
| 2.724000000000005 | 0.012 | 0 | 0 |
| 2.728000000000005 | 0.012 | 0 | 0 |
| 2.732000000000005 | 0.012 | 0 | 0 |
| 2.736000000000005 | 0.011 | 0 | 0 |
| 2.740000000000005 | 0.011 | 0 | 0 |
| 2.744000000000005 | 0.011 | 0 | 0 |
| 2.748000000000005 | 0.011 | 0 | 0 |
| 2.752000000000005 | 0.011 | 0 | 0 |
| 2.756000000000005 | 0.011 | 0 | 0 |
| 2.760000000000005 | 0.01 | 0 | 0 |
| 2.764000000000005 | 0.01 | 0 | 0 |
| 2.768000000000005 | 0.01 | 0 | 0 |
| 2.772000000000005 | 0.01 | 0 | 0 |
| 2.776000000000005 | 0.01 | 0 | 0 |
| 2.780000000000005 | 0.009 | 0 | 0 |
| 2.784000000000005 | 0.009 | 0 | 0 |
| 2.788000000000006 | 0.009 | 0 | 0 |
| 2.792000000000005 | 0.009 | 0 | 0 |
| 2.796000000000005 | 0.009 | 0 | 0 |
| 2.800000000000006 | 0.009 | 0 | 0 |
| 2.804000000000006 | 0.008 | 0 | 0 |
| 2.808000000000006 | 0.008 | 0 | 0 |
| 2.812000000000006 | 0.008 | 0 | 0 |
| 2.816000000000006 | 0.008 | 0 | 0 |
| 2.820000000000006 | 0.008 | 0 | 0 |
| 2.824000000000006 | 0.008 | 0 | 0 |
| 2.828000000000006 | 0.008 | 0 | 0 |
| 2.832000000000006 | 0.007 | 0 | 0 |
| 2.836000000000006 | 0.007 | 0 | 0 |
| 2.840000000000006 | 0.007 | 0 | 0 |
| 2.844000000000006 | 0.007 | 0 | 0 |
| 2.848000000000006 | 0.007 | 0 | 0 |
| 2.852000000000006 | 0.007 | 0 | 0 |
| 2.856000000000006 | 0.007 | 0 | 0 |
| 2.860000000000006 | 0.007 | 0 | 0 |
| 2.864000000000006 | 0.006 | 0 | 0 |
| 2.868000000000006 | 0.006 | 0 | 0 |
| 2.872000000000006 | 0.006 | 0 | 0 |
| 2.876000000000006 | 0.006 | 0 | 0 |
| 2.880000000000006 | 0.006 | 0 | 0 |
| 2.884000000000006 | 0.006 | 0 | 0 |
| 2.888000000000006 | 0.006 | 0 | 0 |
| 2.892000000000006 | 0.006 | 0 | 0 |
| 2.896000000000006 | 0.006 | 0 | 0 |
| 2.900000000000006 | 0.005 | 0 | 0 |
| 2.904000000000006 | 0.005 | 0 | 0 |
| 2.908000000000006 | 0.005 | 0 | 0 |
| 2.912000000000006 | 0.005 | 0 | 0 |
| 2.916000000000006 | 0.005 | 0 | 0 |
| 2.920000000000006 | 0.005 | 0 | 0 |
| 2.924000000000006 | 0.005 | 0 | 0 |
| 2.928000000000006 | 0.005 | 0 | 0 |
| 2.932000000000006 | 0.005 | 0 | 0 |
| 2.936000000000006 | 0.005 | 0 | 0 |
| 2.940000000000006 | 0.004 | 0 | 0 |
| 2.944000000000006 | 0.004 | 0 | 0 |
| 2.948000000000006 | 0.004 | 0 | 0 |
| 2.952000000000006 | 0.004 | 0 | 0 |
| 2.956000000000006 | 0.004 | 0 | 0 |
| 2.960000000000006 | 0.004 | 0 | 0 |
| 2.964000000000006 | 0.004 | 0 | 0 |
| 2.968000000000006 | 0.004 | 0 | 0 |
| 2.972000000000006 | 0.004 | 0 | 0 |
| 2.976000000000006 | 0.004 | 0 | 0 |
| 2.980000000000006 | 0.004 | 0 | 0 |
| 2.984000000000006 | 0.004 | 0 | 0 |
| 2.988000000000006 | 0.004 | 0 | 0 |
| 2.992000000000006 | 0.003 | 0 | 0 |
| 2.996000000000006 | 0.003 | 0 | 0 |
| 3.000000000000006 | 0.003 | 0 | 0 |
| 3.004000000000006 | 0.003 | 0 | 0 |
| 3.008000000000006 | 0.003 | 0 | 0 |
| 3.012000000000006 | 0.003 | 0 | 0 |
| 3.016000000000006 | 0.003 | 0 | 0 |
| 3.020000000000006 | 0.003 | 0 | 0 |
| 3.024000000000006 | 0.003 | 0 | 0 |
| 3.028000000000006 | 0.003 | 0 | 0 |
| 3.032000000000006 | 0.003 | 0 | 0 |
| 3.036000000000006 | 0.003 | 0 | 0 |
| 3.040000000000006 | 0.003 | 0 | 0 |
| 3.044000000000006 | 0.003 | 0 | 0 |
| 3.048000000000006 | 0.003 | 0 | 0 |
| 3.052000000000006 | 0.003 | 0 | 0 |
| 3.056000000000006 | 0.003 | 0 | 0 |
| 3.060000000000006 | 0.002 | 0 | 0 |
| 3.064000000000006 | 0.002 | 0 | 0 |
| 3.068000000000006 | 0.002 | 0 | 0 |
| 3.072000000000006 | 0.002 | 0 | 0 |
| 3.076000000000006 | 0.002 | 0 | 0 |
| 3.080000000000006 | 0.002 | 0 | 0 |
| 3.084000000000006 | 0.002 | 0 | 0 |
| 3.088000000000006 | 0.002 | 0 | 0 |
| 3.092000000000006 | 0.002 | 0 | 0 |
| 3.096000000000006 | 0.002 | 0 | 0 |
| 3.100000000000006 | 0.002 | 0 | 0 |
| 3.104000000000006 | 0.002 | 0 | 0 |
| 3.108000000000006 | 0.002 | 0 | 0 |
| 3.112000000000006 | 0.002 | 0 | 0 |
| 3.116000000000006 | 0.002 | 0 | 0 |
| 3.120000000000006 | 0.002 | 0 | 0 |
| 3.124000000000006 | 0.002 | 0 | 0 |
| 3.128000000000006 | 0.002 | 0 | 0 |
| 3.132000000000006 | 0.002 | 0 | 0 |
| 3.136000000000006 | 0.002 | 0 | 0 |
| 3.140000000000006 | 0.002 | 0 | 0 |
| 3.144000000000006 | 0.002 | 0 | 0 |
| 3.148000000000006 | 0.002 | 0 | 0 |
| 3.152000000000006 | 0.002 | 0 | 0 |
| 3.156000000000006 | 0.001 | 0 | 0 |
| 3.160000000000006 | 0.001 | 0 | 0 |
| 3.164000000000006 | 0.001 | 0 | 0 |
| 3.168000000000006 | 0.001 | 0 | 0 |
| 3.172000000000006 | 0.001 | 0 | 0 |
| 3.176000000000006 | 0.001 | 0 | 0 |
| 3.180000000000006 | 0.001 | 0 | 0 |
| 3.184000000000006 | 0.001 | 0 | 0 |
| 3.188000000000006 | 0.001 | 0 | 0 |
| 3.192000000000006 | 0.001 | 0 | 0 |
| 3.196000000000006 | 0.001 | 0 | 0 |
| 3.200000000000006 | 0.001 | 0 | 0 |
| 3.204000000000006 | 0.001 | 0 | 0 |
| 3.208000000000006 | 0.001 | 0 | 0 |
| 3.212000000000006 | 0.001 | 0 | 0 |
| 3.216000000000006 | 0.001 | 0 | 0 |
| 3.220000000000006 | 0.001 | 0 | 0 |
| 3.224000000000006 | 0.001 | 0 | 0 |
| 3.228000000000006 | 0.001 | 0 | 0 |
| 3.232000000000006 | 0.001 | 0 | 0 |
| 3.236000000000006 | 0.001 | 0 | 0 |
| 3.240000000000006 | 0.001 | 0 | 0 |
| 3.244000000000006 | 0.001 | 0 | 0 |
| 3.248000000000006 | 0.001 | 0 | 0 |
| 3.252000000000006 | 0.001 | 0 | 0 |
| 3.256000000000006 | 0.001 | 0 | 0 |
| 3.260000000000006 | 0.001 | 0 | 0 |
| 3.264000000000006 | 0.001 | 0 | 0 |
| 3.268000000000006 | 0.001 | 0 | 0 |
| 3.272000000000006 | 0.001 | 0 | 0 |
| 3.276000000000006 | 0.001 | 0 | 0 |
| 3.280000000000006 | 0.001 | 0 | 0 |
| 3.284000000000006 | 0.001 | 0 | 0 |
| 3.288000000000006 | 0.001 | 0 | 0 |
| 3.292000000000006 | 0.001 | 0 | 0 |
| 3.296000000000006 | 0.001 | 0 | 0 |
| 3.300000000000006 | 0.001 | 0 | 0 |
| 3.304000000000006 | 0.001 | 0 | 0 |
| 3.308000000000006 | 0.001 | 0 | 0 |
| 3.312000000000006 | 0.001 | 0 | 0 |
| 3.316000000000006 | 0.001 | 0 | 0 |
| 3.320000000000006 | 0.001 | 0 | 0 |
| 3.324000000000006 | 0.001 | 0 | 0 |
| 3.328000000000006 | 0.001 | 0 | 0 |
| 3.332000000000006 | 0.001 | 0 | 0 |
| 3.336000000000006 | 0.001 | 0 | 0 |
| 3.340000000000006 | 0.001 | 0 | 0 |
| 3.344000000000006 | 0.001 | 0 | 0 |
| 3.348000000000006 | 0.001 | 0 | 0 |
| 3.352000000000006 | 0 | 0 | 0 |
| 3.356000000000006 | 0 | 0 | 0 |
| 3.360000000000006 | 0 | 0 | 0 |
| 3.364000000000006 | 0 | 0 | 0 |
| 3.368000000000006 | 0 | 0 | 0 |
| 3.372000000000006 | 0 | 0 | 0 |
| 3.376000000000006 | 0 | 0 | 0 |
| 3.380000000000006 | 0 | 0 | 0 |
| 3.384000000000006 | 0 | 0 | 0 |
| 3.388000000000006 | 0 | 0 | 0 |
| 3.392000000000006 | 0 | 0 | 0 |
| 3.396000000000006 | 0 | 0 | 0 |
| 3.400000000000006 | 0 | 0 | 0 |
| 3.404000000000006 | 0 | 0 | 0 |
| 3.408000000000006 | 0 | 0 | 0 |
| 3.412000000000006 | 0 | 0 | 0 |
| 3.416000000000006 | 0 | 0 | 0 |
| 3.420000000000006 | 0 | 0 | 0 |
| 3.424000000000006 | 0 | 0 | 0 |
| 3.428000000000006 | 0 | 0 | 0 |
| 3.432000000000006 | 0 | 0 | 0 |
| 3.436000000000006 | 0 | 0 | 0 |
| 3.440000000000006 | 0 | 0 | 0 |
| 3.444000000000006 | 0 | 0 | 0 |
| 3.448000000000006 | 0 | 0 | 0 |
| 3.452000000000006 | 0 | 0 | 0 |
| 3.456000000000006 | 0 | 0 | 0 |
| 3.460000000000006 | 0 | 0 | 0 |
| 3.464000000000006 | 0 | 0 | 0 |
| 3.468000000000006 | 0 | 0 | 0 |
| 3.472000000000006 | 0 | 0 | 0 |
| 3.476000000000006 | 0 | 0 | 0 |
| 3.480000000000006 | 0 | 0 | 0 |
| 3.484000000000006 | 0 | 0 | 0 |
| 3.488000000000006 | 0 | 0 | 0 |
| 3.492000000000006 | 0 | 0 | 0 |
| 3.496000000000006 | 0 | 0 | 0 |
| 3.500000000000006 | 0 | 0 | 0 |
| 3.504000000000006 | 0 | 0 | 0 |
| 3.508000000000006 | 0 | 0 | 0 |
| 3.512000000000006 | 0 | 0 | 0 |
| 3.516000000000006 | 0 | 0 | 0 |
| 3.520000000000006 | 0 | 0 | 0 |
| 3.524000000000006 | 0 | 0 | 0 |
| 3.528000000000006 | 0 | 0 | 0 |
| 3.532000000000006 | 0 | 0 | 0 |
| 3.536000000000006 | 0 | 0 | 0 |
| 3.540000000000006 | 0 | 0 | 0 |
| 3.544000000000006 | 0 | 0 | 0 |
| 3.548000000000006 | 0 | 0 | 0 |
| 3.552000000000006 | 0 | 0 | 0 |
| 3.556000000000006 | 0 | 0 | 0 |
| 3.560000000000006 | 0 | 0 | 0 |
| 3.564000000000006 | 0 | 0 | 0 |
| 3.568000000000006 | 0 | 0 | 0 |
| 3.572000000000006 | 0 | 0 | 0 |
| 3.576000000000006 | 0 | 0 | 0 |
| 3.580000000000006 | 0 | 0 | 0 |
| 3.584000000000006 | 0 | 0 | 0 |
| 3.588000000000006 | 0 | 0 | 0 |
| 3.592000000000006 | 0 | 0 | 0 |
| 3.596000000000006 | 0 | 0 | 0 |
| 3.600000000000006 | 0 | 0 | 0 |
| 3.604000000000006 | 0 | 0 | 0 |
| 3.608000000000006 | 0 | 0 | 0 |
| 3.612000000000006 | 0 | 0 | 0 |
| 3.616000000000006 | 0 | 0 | 0 |
| 3.620000000000006 | 0 | 0 | 0 |
| 3.624000000000006 | 0 | 0 | 0 |
| 3.628000000000006 | 0 | 0 | 0 |
| 3.632000000000006 | 0 | 0 | 0 |
| 3.636000000000006 | 0 | 0 | 0 |
| 3.640000000000006 | 0 | 0 | 0 |
| 3.644000000000006 | 0 | 0 | 0 |
| 3.648000000000006 | 0 | 0 | 0 |
| 3.652000000000006 | 0 | 0 | 0 |
| 3.656000000000006 | 0 | 0 | 0 |
| 3.660000000000006 | 0 | 0 | 0 |
| 3.664000000000006 | 0 | 0 | 0 |
| 3.668000000000006 | 0 | 0 | 0 |
| 3.672000000000006 | 0 | 0 | 0 |
| 3.676000000000006 | 0 | 0 | 0 |
| 3.680000000000006 | 0 | 0 | 0 |
| 3.684000000000006 | 0 | 0 | 0 |
| 3.688000000000006 | 0 | 0 | 0 |
| 3.692000000000006 | 0 | 0 | 0 |
| 3.696000000000006 | 0 | 0 | 0 |
| 3.700000000000006 | 0 | 0 | 0 |
| 3.704000000000006 | 0 | 0 | 0 |
| 3.708000000000006 | 0 | 0 | 0 |
| 3.712000000000006 | 0 | 0 | 0 |
| 3.716000000000006 | 0 | 0 | 0 |
| 3.720000000000006 | 0 | 0 | 0 |
| 3.724000000000006 | 0 | 0 | 0 |
| 3.728000000000006 | 0 | 0 | 0 |
| 3.732000000000006 | 0 | 0 | 0 |
| 3.736000000000006 | 0 | 0 | 0 |
| 3.740000000000006 | 0 | 0 | 0 |
| 3.744000000000006 | 0 | 0 | 0 |
| 3.748000000000006 | 0 | 0 | 0 |
| 3.752000000000006 | 0 | 0 | 0 |
| 3.756000000000006 | 0 | 0 | 0 |
| 3.760000000000006 | 0 | 0 | 0 |
| 3.764000000000006 | 0 | 0 | 0 |
| 3.768000000000006 | 0 | 0 | 0 |
| 3.772000000000006 | 0 | 0 | 0 |
| 3.776000000000006 | 0 | 0 | 0 |
| 3.780000000000006 | 0 | 0 | 0 |
| 3.784000000000006 | 0 | 0 | 0 |
| 3.788000000000006 | 0 | 0 | 0 |
| 3.792000000000006 | 0 | 0 | 0 |
| 3.796000000000006 | 0 | 0 | 0 |
| 3.800000000000006 | 0 | 0 | 0 |
| 3.804000000000006 | 0 | 0 | 0 |
| 3.808000000000006 | 0 | 0 | 0 |
| 3.812000000000006 | 0 | 0 | 0 |
| 3.816000000000006 | 0 | 0 | 0 |
| 3.820000000000006 | 0 | 0 | 0 |
| 3.824000000000006 | 0 | 0 | 0 |
| 3.828000000000006 | 0 | 0 | 0 |
| 3.832000000000006 | 0 | 0 | 0 |
| 3.836000000000006 | 0 | 0 | 0 |
| 3.840000000000006 | 0 | 0 | 0 |
| 3.844000000000006 | 0 | 0 | 0 |
| 3.848000000000006 | 0 | 0 | 0 |
| 3.852000000000006 | 0 | 0 | 0 |
| 3.856000000000006 | 0 | 0 | 0 |
| 3.860000000000006 | 0 | 0 | 0 |
| 3.864000000000006 | 0 | 0 | 0 |
| 3.868000000000006 | 0 | 0 | 0 |
| 3.872000000000006 | 0 | 0 | 0 |
| 3.876000000000006 | 0 | 0 | 0 |
| 3.880000000000006 | 0 | 0 | 0 |
| 3.884000000000006 | 0 | 0 | 0 |
| 3.888000000000007 | 0 | 0 | 0 |
| 3.892000000000006 | 0 | 0 | 0 |
| 3.896000000000006 | 0 | 0 | 0 |
| 3.900000000000007 | 0 | 0 | 0 |
| 3.904000000000007 | 0 | 0 | 0 |
| 3.908000000000007 | 0 | 0 | 0 |
| 3.912000000000007 | 0 | 0 | 0 |
| 3.916000000000007 | 0 | 0 | 0 |
| 3.920000000000007 | 0 | 0 | 0 |
| 3.924000000000007 | 0 | 0 | 0 |
| 3.928000000000007 | 0 | 0 | 0 |
| 3.932000000000007 | 0 | 0 | 0 |
| 3.936000000000007 | 0 | 0 | 0 |
| 3.940000000000007 | 0 | 0 | 0 |
| 3.944000000000007 | 0 | 0 | 0 |
| 3.948000000000007 | 0 | 0 | 0 |
| 3.952000000000007 | 0 | 0 | 0 |
| 3.956000000000007 | 0 | 0 | 0 |
| 3.960000000000007 | 0 | 0 | 0 |
| 3.964000000000007 | 0 | 0 | 0 |
| 3.968000000000007 | 0 | 0 | 0 |
| 3.972000000000007 | 0 | 0 | 0 |
| 3.976000000000007 | 0 | 0 | 0 |
| 3.980000000000007 | 0 | 0 | 0 |
| 3.984000000000007 | 0 | 0 | 0 |
| 3.988000000000007 | 0 | 0 | 0 |
| 3.992000000000007 | 0 | 0 | 0 |
| 3.996000000000007 | 0 | 0 | 0 |
| 4.000000000000006 | 0 | 0 | 0 |